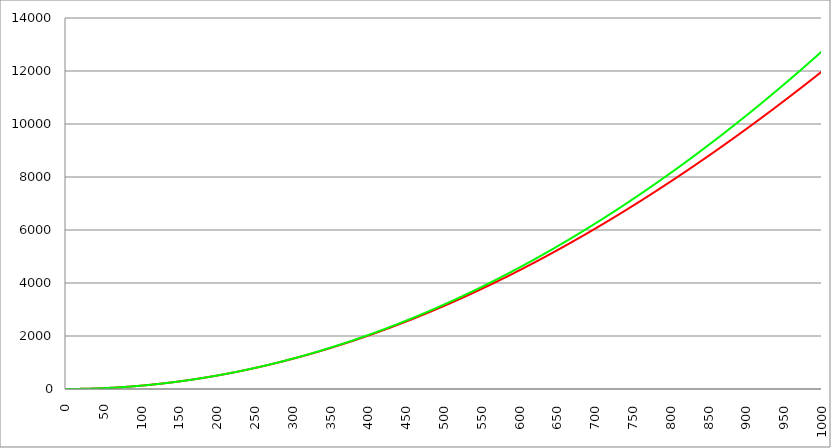
| Category | Series 1 | Series 0 | Series 2 |
|---|---|---|---|
| 0.0 | 0 | 0 |  |
| 0.5 | 0.003 | 0.003 |  |
| 1.0 | 0.013 | 0.013 |  |
| 1.5 | 0.029 | 0.029 |  |
| 2.0 | 0.051 | 0.051 |  |
| 2.5 | 0.08 | 0.08 |  |
| 3.0 | 0.115 | 0.115 |  |
| 3.5 | 0.156 | 0.156 |  |
| 4.0 | 0.204 | 0.204 |  |
| 4.5 | 0.258 | 0.258 |  |
| 5.0 | 0.319 | 0.319 |  |
| 5.5 | 0.385 | 0.385 |  |
| 6.0 | 0.459 | 0.459 |  |
| 6.5 | 0.538 | 0.538 |  |
| 7.0 | 0.624 | 0.624 |  |
| 7.5 | 0.717 | 0.717 |  |
| 8.0 | 0.816 | 0.816 |  |
| 8.5 | 0.921 | 0.921 |  |
| 9.0 | 1.032 | 1.032 |  |
| 9.5 | 1.15 | 1.15 |  |
| 10.0 | 1.274 | 1.274 |  |
| 10.5 | 1.405 | 1.405 |  |
| 11.0 | 1.542 | 1.542 |  |
| 11.5 | 1.685 | 1.685 |  |
| 12.0 | 1.835 | 1.835 |  |
| 12.5 | 1.991 | 1.991 |  |
| 13.0 | 2.154 | 2.154 |  |
| 13.5 | 2.323 | 2.323 |  |
| 14.0 | 2.498 | 2.498 |  |
| 14.5 | 2.679 | 2.679 |  |
| 15.0 | 2.867 | 2.867 |  |
| 15.5 | 3.062 | 3.062 |  |
| 16.0 | 3.262 | 3.262 |  |
| 16.5 | 3.469 | 3.469 |  |
| 17.0 | 3.683 | 3.683 |  |
| 17.5 | 3.903 | 3.903 |  |
| 18.0 | 4.129 | 4.129 |  |
| 18.5 | 4.361 | 4.362 |  |
| 19.0 | 4.6 | 4.6 |  |
| 19.5 | 4.846 | 4.846 |  |
| 20.0 | 5.097 | 5.097 |  |
| 20.5 | 5.355 | 5.356 |  |
| 21.0 | 5.62 | 5.62 |  |
| 21.5 | 5.891 | 5.891 |  |
| 22.0 | 6.168 | 6.168 |  |
| 22.5 | 6.451 | 6.451 |  |
| 23.0 | 6.741 | 6.741 |  |
| 23.5 | 7.037 | 7.038 |  |
| 24.0 | 7.34 | 7.34 |  |
| 24.5 | 7.649 | 7.649 |  |
| 25.0 | 7.964 | 7.965 |  |
| 25.5 | 8.286 | 8.287 |  |
| 26.0 | 8.614 | 8.615 |  |
| 26.5 | 8.949 | 8.949 |  |
| 27.0 | 9.29 | 9.29 |  |
| 27.5 | 9.637 | 9.637 |  |
| 28.0 | 9.991 | 9.991 |  |
| 28.5 | 10.351 | 10.351 |  |
| 29.0 | 10.717 | 10.717 |  |
| 29.5 | 11.09 | 11.09 |  |
| 30.0 | 11.469 | 11.469 |  |
| 30.5 | 11.854 | 11.855 |  |
| 31.0 | 12.246 | 12.247 |  |
| 31.5 | 12.644 | 12.645 |  |
| 32.0 | 13.049 | 13.05 |  |
| 32.5 | 13.46 | 13.461 |  |
| 33.0 | 13.877 | 13.878 |  |
| 33.5 | 14.301 | 14.302 |  |
| 34.0 | 14.731 | 14.732 |  |
| 34.5 | 15.167 | 15.168 |  |
| 35.0 | 15.61 | 15.611 |  |
| 35.5 | 16.059 | 16.06 |  |
| 36.0 | 16.514 | 16.516 |  |
| 36.5 | 16.976 | 16.978 |  |
| 37.0 | 17.445 | 17.446 |  |
| 37.5 | 17.919 | 17.921 |  |
| 38.0 | 18.4 | 18.402 |  |
| 38.5 | 18.887 | 18.889 |  |
| 39.0 | 19.381 | 19.383 |  |
| 39.5 | 19.881 | 19.883 |  |
| 40.0 | 20.388 | 20.39 |  |
| 40.5 | 20.901 | 20.903 |  |
| 41.0 | 21.42 | 21.422 |  |
| 41.5 | 21.945 | 21.948 |  |
| 42.0 | 22.477 | 22.48 |  |
| 42.5 | 23.016 | 23.018 |  |
| 43.0 | 23.56 | 23.563 |  |
| 43.5 | 24.111 | 24.114 |  |
| 44.0 | 24.669 | 24.672 |  |
| 44.5 | 25.232 | 25.236 |  |
| 45.0 | 25.802 | 25.806 |  |
| 45.5 | 26.379 | 26.383 |  |
| 46.0 | 26.962 | 26.966 |  |
| 46.5 | 27.551 | 27.555 |  |
| 47.0 | 28.147 | 28.151 |  |
| 47.5 | 28.749 | 28.753 |  |
| 48.0 | 29.357 | 29.361 |  |
| 48.5 | 29.972 | 29.976 |  |
| 49.0 | 30.593 | 30.598 |  |
| 49.5 | 31.22 | 31.225 |  |
| 50.0 | 31.854 | 31.859 |  |
| 50.5 | 32.494 | 32.5 |  |
| 51.0 | 33.141 | 33.146 |  |
| 51.5 | 33.793 | 33.799 |  |
| 52.0 | 34.453 | 34.459 |  |
| 52.5 | 35.118 | 35.125 |  |
| 53.0 | 35.79 | 35.797 |  |
| 53.5 | 36.469 | 36.476 |  |
| 54.0 | 37.153 | 37.161 |  |
| 54.5 | 37.844 | 37.852 |  |
| 55.0 | 38.542 | 38.55 |  |
| 55.5 | 39.246 | 39.254 |  |
| 56.0 | 39.956 | 39.964 |  |
| 56.5 | 40.672 | 40.681 |  |
| 57.0 | 41.395 | 41.404 |  |
| 57.5 | 42.125 | 42.134 |  |
| 58.0 | 42.86 | 42.87 |  |
| 58.5 | 43.602 | 43.612 |  |
| 59.0 | 44.351 | 44.361 |  |
| 59.5 | 45.105 | 45.116 |  |
| 60.0 | 45.866 | 45.877 |  |
| 60.5 | 46.634 | 46.645 |  |
| 61.0 | 47.408 | 47.419 |  |
| 61.5 | 48.188 | 48.2 |  |
| 62.0 | 48.974 | 48.987 |  |
| 62.5 | 49.767 | 49.78 |  |
| 63.0 | 50.566 | 50.58 |  |
| 63.5 | 51.372 | 51.386 |  |
| 64.0 | 52.184 | 52.198 |  |
| 64.5 | 53.002 | 53.017 |  |
| 65.0 | 53.827 | 53.842 |  |
| 65.5 | 54.658 | 54.674 |  |
| 66.0 | 55.495 | 55.511 |  |
| 66.5 | 56.339 | 56.356 |  |
| 67.0 | 57.189 | 57.206 |  |
| 67.5 | 58.046 | 58.063 |  |
| 68.0 | 58.909 | 58.927 |  |
| 68.5 | 59.778 | 59.797 |  |
| 69.0 | 60.654 | 60.673 |  |
| 69.5 | 61.535 | 61.555 |  |
| 70.0 | 62.424 | 62.444 |  |
| 70.5 | 63.318 | 63.339 |  |
| 71.0 | 64.219 | 64.241 |  |
| 71.5 | 65.127 | 65.149 |  |
| 72.0 | 66.041 | 66.063 |  |
| 72.5 | 66.961 | 66.984 |  |
| 73.0 | 67.887 | 67.911 |  |
| 73.5 | 68.82 | 68.845 |  |
| 74.0 | 69.759 | 69.784 |  |
| 74.5 | 70.705 | 70.731 |  |
| 75.0 | 71.657 | 71.683 |  |
| 75.5 | 72.615 | 72.642 |  |
| 76.0 | 73.579 | 73.608 |  |
| 76.5 | 74.55 | 74.579 |  |
| 77.0 | 75.528 | 75.557 |  |
| 77.5 | 76.511 | 76.542 |  |
| 78.0 | 77.501 | 77.533 |  |
| 78.5 | 78.498 | 78.53 |  |
| 79.0 | 79.5 | 79.533 |  |
| 79.5 | 80.51 | 80.543 |  |
| 80.0 | 81.525 | 81.56 |  |
| 80.5 | 82.547 | 82.582 |  |
| 81.0 | 83.575 | 83.611 |  |
| 81.5 | 84.609 | 84.647 |  |
| 82.0 | 85.65 | 85.689 |  |
| 82.5 | 86.698 | 86.737 |  |
| 83.0 | 87.751 | 87.791 |  |
| 83.5 | 88.811 | 88.852 |  |
| 84.0 | 89.877 | 89.919 |  |
| 84.5 | 90.95 | 90.993 |  |
| 85.0 | 92.029 | 92.073 |  |
| 85.5 | 93.114 | 93.16 |  |
| 86.0 | 94.206 | 94.252 |  |
| 86.5 | 95.304 | 95.351 |  |
| 87.0 | 96.409 | 96.457 |  |
| 87.5 | 97.519 | 97.569 |  |
| 88.0 | 98.636 | 98.687 |  |
| 88.5 | 99.76 | 99.812 |  |
| 89.0 | 100.89 | 100.943 |  |
| 89.5 | 102.026 | 102.08 |  |
| 90.0 | 103.168 | 103.224 |  |
| 90.5 | 104.317 | 104.374 |  |
| 91.0 | 105.473 | 105.53 |  |
| 91.5 | 106.634 | 106.693 |  |
| 92.0 | 107.802 | 107.863 |  |
| 92.5 | 108.976 | 109.038 |  |
| 93.0 | 110.157 | 110.22 |  |
| 93.5 | 111.344 | 111.408 |  |
| 94.0 | 112.537 | 112.603 |  |
| 94.5 | 113.737 | 113.804 |  |
| 95.0 | 114.943 | 115.012 |  |
| 95.5 | 116.155 | 116.226 |  |
| 96.0 | 117.374 | 117.446 |  |
| 96.5 | 118.599 | 118.672 |  |
| 97.0 | 119.831 | 119.905 |  |
| 97.5 | 121.068 | 121.145 |  |
| 98.0 | 122.313 | 122.39 |  |
| 98.5 | 123.563 | 123.642 |  |
| 99.0 | 124.82 | 124.901 |  |
| 99.5 | 126.083 | 126.166 |  |
| 100.0 | 127.352 | 127.437 |  |
| 100.5 | 128.628 | 128.714 |  |
| 101.0 | 129.911 | 129.998 |  |
| 101.5 | 131.199 | 131.289 |  |
| 102.0 | 132.494 | 132.585 |  |
| 102.5 | 133.795 | 133.888 |  |
| 103.0 | 135.103 | 135.198 |  |
| 103.5 | 136.417 | 136.514 |  |
| 104.0 | 137.737 | 137.836 |  |
| 104.5 | 139.064 | 139.164 |  |
| 105.0 | 140.397 | 140.499 |  |
| 105.5 | 141.736 | 141.84 |  |
| 106.0 | 143.082 | 143.188 |  |
| 106.5 | 144.434 | 144.542 |  |
| 107.0 | 145.792 | 145.902 |  |
| 107.5 | 147.157 | 147.269 |  |
| 108.0 | 148.528 | 148.642 |  |
| 108.5 | 149.905 | 150.022 |  |
| 109.0 | 151.289 | 151.408 |  |
| 109.5 | 152.679 | 152.8 |  |
| 110.0 | 154.075 | 154.199 |  |
| 110.5 | 155.478 | 155.604 |  |
| 111.0 | 156.887 | 157.015 |  |
| 111.5 | 158.302 | 158.433 |  |
| 112.0 | 159.724 | 159.857 |  |
| 112.5 | 161.152 | 161.287 |  |
| 113.0 | 162.587 | 162.724 |  |
| 113.5 | 164.027 | 164.167 |  |
| 114.0 | 165.474 | 165.617 |  |
| 114.5 | 166.928 | 167.073 |  |
| 115.0 | 168.388 | 168.535 |  |
| 115.5 | 169.854 | 170.004 |  |
| 116.0 | 171.326 | 171.479 |  |
| 116.5 | 172.805 | 172.96 |  |
| 117.0 | 174.29 | 174.448 |  |
| 117.5 | 175.782 | 175.943 |  |
| 118.0 | 177.28 | 177.443 |  |
| 118.5 | 178.784 | 178.95 |  |
| 119.0 | 180.294 | 180.463 |  |
| 119.5 | 181.811 | 181.983 |  |
| 120.0 | 183.334 | 183.509 |  |
| 120.5 | 184.864 | 185.042 |  |
| 121.0 | 186.4 | 186.58 |  |
| 121.5 | 187.942 | 188.125 |  |
| 122.0 | 189.49 | 189.677 |  |
| 122.5 | 191.045 | 191.235 |  |
| 123.0 | 192.606 | 192.799 |  |
| 123.5 | 194.174 | 194.37 |  |
| 124.0 | 195.748 | 195.947 |  |
| 124.5 | 197.328 | 197.53 |  |
| 125.0 | 198.914 | 199.12 |  |
| 125.5 | 200.507 | 200.716 |  |
| 126.0 | 202.106 | 202.319 |  |
| 126.5 | 203.712 | 203.928 |  |
| 127.0 | 205.324 | 205.543 |  |
| 127.5 | 206.942 | 207.165 |  |
| 128.0 | 208.566 | 208.793 |  |
| 128.5 | 210.197 | 210.427 |  |
| 129.0 | 211.834 | 212.068 |  |
| 129.5 | 213.478 | 213.715 |  |
| 130.0 | 215.127 | 215.368 |  |
| 130.5 | 216.784 | 217.028 |  |
| 131.0 | 218.446 | 218.694 |  |
| 131.5 | 220.115 | 220.367 |  |
| 132.0 | 221.79 | 222.046 |  |
| 132.5 | 223.471 | 223.731 |  |
| 133.0 | 225.159 | 225.423 |  |
| 133.5 | 226.853 | 227.121 |  |
| 134.0 | 228.554 | 228.826 |  |
| 134.5 | 230.261 | 230.536 |  |
| 135.0 | 231.974 | 232.254 |  |
| 135.5 | 233.693 | 233.977 |  |
| 136.0 | 235.419 | 235.707 |  |
| 136.5 | 237.151 | 237.444 |  |
| 137.0 | 238.889 | 239.186 |  |
| 137.5 | 240.634 | 240.935 |  |
| 138.0 | 242.385 | 242.691 |  |
| 138.5 | 244.142 | 244.453 |  |
| 139.0 | 245.906 | 246.221 |  |
| 139.5 | 247.676 | 247.995 |  |
| 140.0 | 249.452 | 249.776 |  |
| 140.5 | 251.235 | 251.564 |  |
| 141.0 | 253.024 | 253.357 |  |
| 141.5 | 254.819 | 255.157 |  |
| 142.0 | 256.621 | 256.964 |  |
| 142.5 | 258.429 | 258.776 |  |
| 143.0 | 260.243 | 260.596 |  |
| 143.5 | 262.064 | 262.421 |  |
| 144.0 | 263.891 | 264.253 |  |
| 144.5 | 265.724 | 266.091 |  |
| 145.0 | 267.563 | 267.936 |  |
| 145.5 | 269.409 | 269.787 |  |
| 146.0 | 271.261 | 271.644 |  |
| 146.5 | 273.12 | 273.508 |  |
| 147.0 | 274.985 | 275.378 |  |
| 147.5 | 276.856 | 277.255 |  |
| 148.0 | 278.733 | 279.138 |  |
| 148.5 | 280.617 | 281.027 |  |
| 149.0 | 282.507 | 282.923 |  |
| 149.5 | 284.404 | 284.825 |  |
| 150.0 | 286.306 | 286.733 |  |
| 150.5 | 288.215 | 288.648 |  |
| 151.0 | 290.131 | 290.569 |  |
| 151.5 | 292.052 | 292.496 |  |
| 152.0 | 293.98 | 294.43 |  |
| 152.5 | 295.915 | 296.37 |  |
| 153.0 | 297.855 | 298.317 |  |
| 153.5 | 299.802 | 300.27 |  |
| 154.0 | 301.755 | 302.229 |  |
| 154.5 | 303.715 | 304.195 |  |
| 155.0 | 305.681 | 306.167 |  |
| 155.5 | 307.653 | 308.146 |  |
| 156.0 | 309.631 | 310.13 |  |
| 156.5 | 311.616 | 312.122 |  |
| 157.0 | 313.607 | 314.119 |  |
| 157.5 | 315.605 | 316.123 |  |
| 158.0 | 317.608 | 318.133 |  |
| 158.5 | 319.618 | 320.15 |  |
| 159.0 | 321.635 | 322.173 |  |
| 159.5 | 323.657 | 324.203 |  |
| 160.0 | 325.686 | 326.238 |  |
| 160.5 | 327.722 | 328.281 |  |
| 161.0 | 329.763 | 330.329 |  |
| 161.5 | 331.811 | 332.384 |  |
| 162.0 | 333.865 | 334.445 |  |
| 162.5 | 335.926 | 336.513 |  |
| 163.0 | 337.992 | 338.587 |  |
| 163.5 | 340.066 | 340.667 |  |
| 164.0 | 342.145 | 342.754 |  |
| 164.5 | 344.231 | 344.847 |  |
| 165.0 | 346.323 | 346.947 |  |
| 165.5 | 348.421 | 349.053 |  |
| 166.0 | 350.526 | 351.165 |  |
| 166.5 | 352.636 | 353.284 |  |
| 167.0 | 354.754 | 355.409 |  |
| 167.5 | 356.877 | 357.54 |  |
| 168.0 | 359.007 | 359.678 |  |
| 168.5 | 361.143 | 361.822 |  |
| 169.0 | 363.286 | 363.972 |  |
| 169.5 | 365.434 | 366.129 |  |
| 170.0 | 367.589 | 368.293 |  |
| 170.5 | 369.751 | 370.462 |  |
| 171.0 | 371.918 | 372.638 |  |
| 171.5 | 374.092 | 374.82 |  |
| 172.0 | 376.272 | 377.009 |  |
| 172.5 | 378.459 | 379.204 |  |
| 173.0 | 380.652 | 381.406 |  |
| 173.5 | 382.851 | 383.614 |  |
| 174.0 | 385.056 | 385.828 |  |
| 174.5 | 387.268 | 388.048 |  |
| 175.0 | 389.486 | 390.275 |  |
| 175.5 | 391.71 | 392.509 |  |
| 176.0 | 393.941 | 394.748 |  |
| 176.5 | 396.178 | 396.994 |  |
| 177.0 | 398.421 | 399.247 |  |
| 177.5 | 400.67 | 401.506 |  |
| 178.0 | 402.926 | 403.771 |  |
| 178.5 | 405.188 | 406.042 |  |
| 179.0 | 407.456 | 408.32 |  |
| 179.5 | 409.731 | 410.605 |  |
| 180.0 | 412.012 | 412.895 |  |
| 180.5 | 414.299 | 415.192 |  |
| 181.0 | 416.593 | 417.496 |  |
| 181.5 | 418.892 | 419.806 |  |
| 182.0 | 421.198 | 422.122 |  |
| 182.5 | 423.511 | 424.444 |  |
| 183.0 | 425.829 | 426.773 |  |
| 183.5 | 428.154 | 429.109 |  |
| 184.0 | 430.486 | 431.45 |  |
| 184.5 | 432.823 | 433.798 |  |
| 185.0 | 435.167 | 436.153 |  |
| 185.5 | 437.517 | 438.513 |  |
| 186.0 | 439.873 | 440.881 |  |
| 186.5 | 442.236 | 443.254 |  |
| 187.0 | 444.605 | 445.634 |  |
| 187.5 | 446.98 | 448.02 |  |
| 188.0 | 449.362 | 450.413 |  |
| 188.5 | 451.75 | 452.812 |  |
| 189.0 | 454.144 | 455.217 |  |
| 189.5 | 456.544 | 457.629 |  |
| 190.0 | 458.951 | 460.047 |  |
| 190.5 | 461.364 | 462.472 |  |
| 191.0 | 463.783 | 464.902 |  |
| 191.5 | 466.208 | 467.34 |  |
| 192.0 | 468.64 | 469.783 |  |
| 192.5 | 471.078 | 472.233 |  |
| 193.0 | 473.522 | 474.69 |  |
| 193.5 | 475.973 | 477.152 |  |
| 194.0 | 478.43 | 479.621 |  |
| 194.5 | 480.893 | 482.097 |  |
| 195.0 | 483.362 | 484.579 |  |
| 195.5 | 485.838 | 487.067 |  |
| 196.0 | 488.32 | 489.561 |  |
| 196.5 | 490.808 | 492.062 |  |
| 197.0 | 493.303 | 494.57 |  |
| 197.5 | 495.804 | 497.083 |  |
| 198.0 | 498.311 | 499.603 |  |
| 198.5 | 500.824 | 502.13 |  |
| 199.0 | 503.344 | 504.663 |  |
| 199.5 | 505.87 | 507.202 |  |
| 200.0 | 508.402 | 509.747 |  |
| 200.5 | 510.94 | 512.299 |  |
| 201.0 | 513.485 | 514.858 |  |
| 201.5 | 516.036 | 517.422 |  |
| 202.0 | 518.593 | 519.993 |  |
| 202.5 | 521.157 | 522.571 |  |
| 203.0 | 523.727 | 525.155 |  |
| 203.5 | 526.303 | 527.745 |  |
| 204.0 | 528.885 | 530.341 |  |
| 204.5 | 531.474 | 532.944 |  |
| 205.0 | 534.069 | 535.553 |  |
| 205.5 | 536.67 | 538.169 |  |
| 206.0 | 539.277 | 540.791 |  |
| 206.5 | 541.891 | 543.419 |  |
| 207.0 | 544.511 | 546.054 |  |
| 207.5 | 547.137 | 548.695 |  |
| 208.0 | 549.769 | 551.343 |  |
| 208.5 | 552.408 | 553.997 |  |
| 209.0 | 555.053 | 556.657 |  |
| 209.5 | 557.704 | 559.324 |  |
| 210.0 | 560.362 | 561.997 |  |
| 210.5 | 563.026 | 564.676 |  |
| 211.0 | 565.696 | 567.362 |  |
| 211.5 | 568.372 | 570.054 |  |
| 212.0 | 571.054 | 572.752 |  |
| 212.5 | 573.743 | 575.457 |  |
| 213.0 | 576.438 | 578.168 |  |
| 213.5 | 579.14 | 580.886 |  |
| 214.0 | 581.847 | 583.61 |  |
| 214.5 | 584.561 | 586.34 |  |
| 215.0 | 587.281 | 589.077 |  |
| 215.5 | 590.008 | 591.82 |  |
| 216.0 | 592.74 | 594.569 |  |
| 216.5 | 595.479 | 597.325 |  |
| 217.0 | 598.224 | 600.087 |  |
| 217.5 | 600.976 | 602.856 |  |
| 218.0 | 603.733 | 605.631 |  |
| 218.5 | 606.497 | 608.412 |  |
| 219.0 | 609.267 | 611.2 |  |
| 219.5 | 612.044 | 613.994 |  |
| 220.0 | 614.826 | 616.794 |  |
| 220.5 | 617.615 | 619.601 |  |
| 221.0 | 620.41 | 622.414 |  |
| 221.5 | 623.212 | 625.234 |  |
| 222.0 | 626.019 | 628.06 |  |
| 222.5 | 628.833 | 630.892 |  |
| 223.0 | 631.653 | 633.731 |  |
| 223.5 | 634.48 | 636.576 |  |
| 224.0 | 637.312 | 639.427 |  |
| 224.5 | 640.151 | 642.285 |  |
| 225.0 | 642.996 | 645.149 |  |
| 225.5 | 645.848 | 648.02 |  |
| 226.0 | 648.705 | 650.896 |  |
| 226.5 | 651.569 | 653.78 |  |
| 227.0 | 654.439 | 656.669 |  |
| 227.5 | 657.316 | 659.565 |  |
| 228.0 | 660.198 | 662.468 |  |
| 228.5 | 663.087 | 665.376 |  |
| 229.0 | 665.982 | 668.292 |  |
| 229.5 | 668.884 | 671.213 |  |
| 230.0 | 671.791 | 674.141 |  |
| 230.5 | 674.705 | 677.075 |  |
| 231.0 | 677.625 | 680.016 |  |
| 231.5 | 680.551 | 682.963 |  |
| 232.0 | 683.484 | 685.916 |  |
| 232.5 | 686.422 | 688.876 |  |
| 233.0 | 689.367 | 691.842 |  |
| 233.5 | 692.319 | 694.814 |  |
| 234.0 | 695.276 | 697.793 |  |
| 234.5 | 698.24 | 700.778 |  |
| 235.0 | 701.21 | 703.77 |  |
| 235.5 | 704.186 | 706.768 |  |
| 236.0 | 707.168 | 709.772 |  |
| 236.5 | 710.157 | 712.783 |  |
| 237.0 | 713.152 | 715.8 |  |
| 237.5 | 716.153 | 718.824 |  |
| 238.0 | 719.16 | 721.853 |  |
| 238.5 | 722.174 | 724.89 |  |
| 239.0 | 725.194 | 727.932 |  |
| 239.5 | 728.22 | 730.981 |  |
| 240.0 | 731.252 | 734.036 |  |
| 240.5 | 734.29 | 737.098 |  |
| 241.0 | 737.335 | 740.166 |  |
| 241.5 | 740.386 | 743.24 |  |
| 242.0 | 743.443 | 746.321 |  |
| 242.5 | 746.506 | 749.408 |  |
| 243.0 | 749.576 | 752.502 |  |
| 243.5 | 752.652 | 755.602 |  |
| 244.0 | 755.734 | 758.708 |  |
| 244.5 | 758.822 | 761.821 |  |
| 245.0 | 761.917 | 764.94 |  |
| 245.5 | 765.017 | 768.065 |  |
| 246.0 | 768.124 | 771.197 |  |
| 246.5 | 771.238 | 774.335 |  |
| 247.0 | 774.357 | 777.48 |  |
| 247.5 | 777.483 | 780.63 |  |
| 248.0 | 780.614 | 783.788 |  |
| 248.5 | 783.752 | 786.951 |  |
| 249.0 | 786.897 | 790.121 |  |
| 249.5 | 790.047 | 793.298 |  |
| 250.0 | 793.204 | 796.48 |  |
| 250.5 | 796.367 | 799.669 |  |
| 251.0 | 799.536 | 802.865 |  |
| 251.5 | 802.711 | 806.067 |  |
| 252.0 | 805.893 | 809.275 |  |
| 252.5 | 809.081 | 812.49 |  |
| 253.0 | 812.275 | 815.711 |  |
| 253.5 | 815.475 | 818.938 |  |
| 254.0 | 818.681 | 822.172 |  |
| 254.5 | 821.894 | 825.412 |  |
| 255.0 | 825.113 | 828.658 |  |
| 255.5 | 828.338 | 831.911 |  |
| 256.0 | 831.569 | 835.17 |  |
| 256.5 | 834.806 | 838.436 |  |
| 257.0 | 838.05 | 841.708 |  |
| 257.5 | 841.3 | 844.986 |  |
| 258.0 | 844.556 | 848.271 |  |
| 258.5 | 847.818 | 851.562 |  |
| 259.0 | 851.087 | 854.859 |  |
| 259.5 | 854.361 | 858.163 |  |
| 260.0 | 857.642 | 861.473 |  |
| 260.5 | 860.929 | 864.79 |  |
| 261.0 | 864.223 | 868.113 |  |
| 261.5 | 867.522 | 871.442 |  |
| 262.0 | 870.828 | 874.778 |  |
| 262.5 | 874.14 | 878.12 |  |
| 263.0 | 877.458 | 881.468 |  |
| 263.5 | 880.782 | 884.823 |  |
| 264.0 | 884.113 | 888.184 |  |
| 264.5 | 887.45 | 891.551 |  |
| 265.0 | 890.793 | 894.925 |  |
| 265.5 | 894.142 | 898.306 |  |
| 266.0 | 897.497 | 901.692 |  |
| 266.5 | 900.858 | 905.085 |  |
| 267.0 | 904.226 | 908.485 |  |
| 267.5 | 907.6 | 911.89 |  |
| 268.0 | 910.98 | 915.302 |  |
| 268.5 | 914.366 | 918.721 |  |
| 269.0 | 917.759 | 922.146 |  |
| 269.5 | 921.158 | 925.577 |  |
| 270.0 | 924.562 | 929.015 |  |
| 270.5 | 927.973 | 932.459 |  |
| 271.0 | 931.391 | 935.909 |  |
| 271.5 | 934.814 | 939.366 |  |
| 272.0 | 938.244 | 942.829 |  |
| 272.5 | 941.68 | 946.298 |  |
| 273.0 | 945.122 | 949.774 |  |
| 273.5 | 948.57 | 953.256 |  |
| 274.0 | 952.024 | 956.745 |  |
| 274.5 | 955.485 | 960.24 |  |
| 275.0 | 958.951 | 963.741 |  |
| 275.5 | 962.424 | 967.249 |  |
| 276.0 | 965.903 | 970.763 |  |
| 276.5 | 969.389 | 974.283 |  |
| 277.0 | 972.88 | 977.81 |  |
| 277.5 | 976.378 | 981.343 |  |
| 278.0 | 979.882 | 984.883 |  |
| 278.5 | 983.392 | 988.429 |  |
| 279.0 | 986.908 | 991.981 |  |
| 279.5 | 990.43 | 995.54 |  |
| 280.0 | 993.959 | 999.105 |  |
| 280.5 | 997.493 | 1002.676 |  |
| 281.0 | 1001.034 | 1006.254 |  |
| 281.5 | 1004.581 | 1009.838 |  |
| 282.0 | 1008.135 | 1013.429 |  |
| 282.5 | 1011.694 | 1017.026 |  |
| 283.0 | 1015.26 | 1020.629 |  |
| 283.5 | 1018.832 | 1024.239 |  |
| 284.0 | 1022.409 | 1027.855 |  |
| 284.5 | 1025.994 | 1031.477 |  |
| 285.0 | 1029.584 | 1035.106 |  |
| 285.5 | 1033.18 | 1038.741 |  |
| 286.0 | 1036.783 | 1042.383 |  |
| 286.5 | 1040.392 | 1046.03 |  |
| 287.0 | 1044.007 | 1049.685 |  |
| 287.5 | 1047.628 | 1053.345 |  |
| 288.0 | 1051.255 | 1057.012 |  |
| 288.5 | 1054.889 | 1060.686 |  |
| 289.0 | 1058.528 | 1064.365 |  |
| 289.5 | 1062.174 | 1068.051 |  |
| 290.0 | 1065.826 | 1071.744 |  |
| 290.5 | 1069.484 | 1075.443 |  |
| 291.0 | 1073.149 | 1079.148 |  |
| 291.5 | 1076.819 | 1082.86 |  |
| 292.0 | 1080.496 | 1086.578 |  |
| 292.5 | 1084.178 | 1090.302 |  |
| 293.0 | 1087.867 | 1094.033 |  |
| 293.5 | 1091.562 | 1097.77 |  |
| 294.0 | 1095.264 | 1101.513 |  |
| 294.5 | 1098.971 | 1105.263 |  |
| 295.0 | 1102.685 | 1109.019 |  |
| 295.5 | 1106.404 | 1112.782 |  |
| 296.0 | 1110.13 | 1116.551 |  |
| 296.5 | 1113.862 | 1120.326 |  |
| 297.0 | 1117.601 | 1124.108 |  |
| 297.5 | 1121.345 | 1127.896 |  |
| 298.0 | 1125.095 | 1131.69 |  |
| 298.5 | 1128.852 | 1135.491 |  |
| 299.0 | 1132.615 | 1139.298 |  |
| 299.5 | 1136.384 | 1143.112 |  |
| 300.0 | 1140.159 | 1146.932 |  |
| 300.5 | 1143.94 | 1150.758 |  |
| 301.0 | 1147.728 | 1154.591 |  |
| 301.5 | 1151.521 | 1158.43 |  |
| 302.0 | 1155.321 | 1162.275 |  |
| 302.5 | 1159.127 | 1166.127 |  |
| 303.0 | 1162.939 | 1169.985 |  |
| 303.5 | 1166.757 | 1173.85 |  |
| 304.0 | 1170.581 | 1177.72 |  |
| 304.5 | 1174.412 | 1181.598 |  |
| 305.0 | 1178.248 | 1185.481 |  |
| 305.5 | 1182.091 | 1189.371 |  |
| 306.0 | 1185.94 | 1193.268 |  |
| 306.5 | 1189.795 | 1197.17 |  |
| 307.0 | 1193.656 | 1201.08 |  |
| 307.5 | 1197.523 | 1204.995 |  |
| 308.0 | 1201.397 | 1208.917 |  |
| 308.5 | 1205.276 | 1212.845 |  |
| 309.0 | 1209.162 | 1216.78 |  |
| 309.5 | 1213.054 | 1220.721 |  |
| 310.0 | 1216.952 | 1224.668 |  |
| 310.5 | 1220.856 | 1228.622 |  |
| 311.0 | 1224.766 | 1232.582 |  |
| 311.5 | 1228.682 | 1236.548 |  |
| 312.0 | 1232.605 | 1240.521 |  |
| 312.5 | 1236.533 | 1244.501 |  |
| 313.0 | 1240.468 | 1248.486 |  |
| 313.5 | 1244.409 | 1252.478 |  |
| 314.0 | 1248.356 | 1256.476 |  |
| 314.5 | 1252.309 | 1260.481 |  |
| 315.0 | 1256.269 | 1264.492 |  |
| 315.5 | 1260.234 | 1268.51 |  |
| 316.0 | 1264.205 | 1272.533 |  |
| 316.5 | 1268.183 | 1276.564 |  |
| 317.0 | 1272.167 | 1280.6 |  |
| 317.5 | 1276.157 | 1284.643 |  |
| 318.0 | 1280.153 | 1288.692 |  |
| 318.5 | 1284.155 | 1292.748 |  |
| 319.0 | 1288.163 | 1296.81 |  |
| 319.5 | 1292.178 | 1300.879 |  |
| 320.0 | 1296.198 | 1304.953 |  |
| 320.5 | 1300.225 | 1309.035 |  |
| 321.0 | 1304.258 | 1313.122 |  |
| 321.5 | 1308.297 | 1317.216 |  |
| 322.0 | 1312.342 | 1321.316 |  |
| 322.5 | 1316.393 | 1325.423 |  |
| 323.0 | 1320.45 | 1329.536 |  |
| 323.5 | 1324.513 | 1333.655 |  |
| 324.0 | 1328.583 | 1337.781 |  |
| 324.5 | 1332.658 | 1341.913 |  |
| 325.0 | 1336.74 | 1346.052 |  |
| 325.5 | 1340.828 | 1350.197 |  |
| 326.0 | 1344.922 | 1354.348 |  |
| 326.5 | 1349.022 | 1358.506 |  |
| 327.0 | 1353.128 | 1362.67 |  |
| 327.5 | 1357.24 | 1366.84 |  |
| 328.0 | 1361.358 | 1371.017 |  |
| 328.5 | 1365.483 | 1375.2 |  |
| 329.0 | 1369.613 | 1379.389 |  |
| 329.5 | 1373.75 | 1383.585 |  |
| 330.0 | 1377.893 | 1387.787 |  |
| 330.5 | 1382.042 | 1391.996 |  |
| 331.0 | 1386.197 | 1396.211 |  |
| 331.5 | 1390.358 | 1400.432 |  |
| 332.0 | 1394.525 | 1404.66 |  |
| 332.5 | 1398.698 | 1408.894 |  |
| 333.0 | 1402.878 | 1413.135 |  |
| 333.5 | 1407.063 | 1417.381 |  |
| 334.0 | 1411.255 | 1421.635 |  |
| 334.5 | 1415.452 | 1425.894 |  |
| 335.0 | 1419.656 | 1430.16 |  |
| 335.5 | 1423.866 | 1434.432 |  |
| 336.0 | 1428.082 | 1438.711 |  |
| 336.5 | 1432.304 | 1442.996 |  |
| 337.0 | 1436.532 | 1447.288 |  |
| 337.5 | 1440.766 | 1451.585 |  |
| 338.0 | 1445.007 | 1455.89 |  |
| 338.5 | 1449.253 | 1460.2 |  |
| 339.0 | 1453.506 | 1464.517 |  |
| 339.5 | 1457.764 | 1468.84 |  |
| 340.0 | 1462.029 | 1473.17 |  |
| 340.5 | 1466.3 | 1477.506 |  |
| 341.0 | 1470.577 | 1481.849 |  |
| 341.5 | 1474.86 | 1486.197 |  |
| 342.0 | 1479.149 | 1490.552 |  |
| 342.5 | 1483.444 | 1494.914 |  |
| 343.0 | 1487.745 | 1499.282 |  |
| 343.5 | 1492.052 | 1503.656 |  |
| 344.0 | 1496.366 | 1508.037 |  |
| 344.5 | 1500.685 | 1512.424 |  |
| 345.0 | 1505.011 | 1516.817 |  |
| 345.5 | 1509.342 | 1521.217 |  |
| 346.0 | 1513.68 | 1525.623 |  |
| 346.5 | 1518.024 | 1530.036 |  |
| 347.0 | 1522.374 | 1534.454 |  |
| 347.5 | 1526.73 | 1538.88 |  |
| 348.0 | 1531.092 | 1543.311 |  |
| 348.5 | 1535.46 | 1547.749 |  |
| 349.0 | 1539.834 | 1552.194 |  |
| 349.5 | 1544.214 | 1556.644 |  |
| 350.0 | 1548.601 | 1561.101 |  |
| 350.5 | 1552.993 | 1565.565 |  |
| 351.0 | 1557.391 | 1570.035 |  |
| 351.5 | 1561.796 | 1574.511 |  |
| 352.0 | 1566.207 | 1578.994 |  |
| 352.5 | 1570.623 | 1583.483 |  |
| 353.0 | 1575.046 | 1587.978 |  |
| 353.5 | 1579.475 | 1592.48 |  |
| 354.0 | 1583.91 | 1596.988 |  |
| 354.5 | 1588.351 | 1601.502 |  |
| 355.0 | 1592.798 | 1606.023 |  |
| 355.5 | 1597.251 | 1610.55 |  |
| 356.0 | 1601.71 | 1615.084 |  |
| 356.5 | 1606.175 | 1619.624 |  |
| 357.0 | 1610.646 | 1624.17 |  |
| 357.5 | 1615.123 | 1628.723 |  |
| 358.0 | 1619.607 | 1633.282 |  |
| 358.5 | 1624.096 | 1637.847 |  |
| 359.0 | 1628.592 | 1642.419 |  |
| 359.5 | 1633.093 | 1646.997 |  |
| 360.0 | 1637.601 | 1651.582 |  |
| 360.5 | 1642.115 | 1656.173 |  |
| 361.0 | 1646.634 | 1660.77 |  |
| 361.5 | 1651.16 | 1665.374 |  |
| 362.0 | 1655.692 | 1669.984 |  |
| 362.5 | 1660.23 | 1674.6 |  |
| 363.0 | 1664.774 | 1679.223 |  |
| 363.5 | 1669.324 | 1683.852 |  |
| 364.0 | 1673.88 | 1688.487 |  |
| 364.5 | 1678.442 | 1693.129 |  |
| 365.0 | 1683.01 | 1697.778 |  |
| 365.5 | 1687.584 | 1702.432 |  |
| 366.0 | 1692.164 | 1707.093 |  |
| 366.5 | 1696.75 | 1711.761 |  |
| 367.0 | 1701.343 | 1716.434 |  |
| 367.5 | 1705.941 | 1721.114 |  |
| 368.0 | 1710.545 | 1725.801 |  |
| 368.5 | 1715.156 | 1730.494 |  |
| 369.0 | 1719.772 | 1735.193 |  |
| 369.5 | 1724.395 | 1739.899 |  |
| 370.0 | 1729.023 | 1744.611 |  |
| 370.5 | 1733.658 | 1749.329 |  |
| 371.0 | 1738.299 | 1754.054 |  |
| 371.5 | 1742.945 | 1758.785 |  |
| 372.0 | 1747.598 | 1763.522 |  |
| 372.5 | 1752.257 | 1768.266 |  |
| 373.0 | 1756.921 | 1773.016 |  |
| 373.5 | 1761.592 | 1777.773 |  |
| 374.0 | 1766.269 | 1782.536 |  |
| 374.5 | 1770.952 | 1787.305 |  |
| 375.0 | 1775.641 | 1792.081 |  |
| 375.5 | 1780.336 | 1796.863 |  |
| 376.0 | 1785.037 | 1801.651 |  |
| 376.5 | 1789.744 | 1806.446 |  |
| 377.0 | 1794.457 | 1811.247 |  |
| 377.5 | 1799.176 | 1816.055 |  |
| 378.0 | 1803.901 | 1820.869 |  |
| 378.5 | 1808.632 | 1825.689 |  |
| 379.0 | 1813.369 | 1830.516 |  |
| 379.5 | 1818.112 | 1835.349 |  |
| 380.0 | 1822.861 | 1840.188 |  |
| 380.5 | 1827.616 | 1845.034 |  |
| 381.0 | 1832.377 | 1849.886 |  |
| 381.5 | 1837.145 | 1854.745 |  |
| 382.0 | 1841.918 | 1859.61 |  |
| 382.5 | 1846.697 | 1864.481 |  |
| 383.0 | 1851.482 | 1869.358 |  |
| 383.5 | 1856.274 | 1874.243 |  |
| 384.0 | 1861.071 | 1879.133 |  |
| 384.5 | 1865.874 | 1884.03 |  |
| 385.0 | 1870.683 | 1888.933 |  |
| 385.5 | 1875.499 | 1893.842 |  |
| 386.0 | 1880.32 | 1898.758 |  |
| 386.5 | 1885.147 | 1903.68 |  |
| 387.0 | 1889.981 | 1908.609 |  |
| 387.5 | 1894.82 | 1913.544 |  |
| 388.0 | 1899.666 | 1918.485 |  |
| 388.5 | 1904.517 | 1923.433 |  |
| 389.0 | 1909.374 | 1928.387 |  |
| 389.5 | 1914.238 | 1933.348 |  |
| 390.0 | 1919.107 | 1938.315 |  |
| 390.5 | 1923.982 | 1943.288 |  |
| 391.0 | 1928.864 | 1948.267 |  |
| 391.5 | 1933.751 | 1953.253 |  |
| 392.0 | 1938.645 | 1958.246 |  |
| 392.5 | 1943.544 | 1963.244 |  |
| 393.0 | 1948.449 | 1968.249 |  |
| 393.5 | 1953.361 | 1973.261 |  |
| 394.0 | 1958.278 | 1978.279 |  |
| 394.5 | 1963.202 | 1983.303 |  |
| 395.0 | 1968.131 | 1988.334 |  |
| 395.5 | 1973.066 | 1993.37 |  |
| 396.0 | 1978.008 | 1998.414 |  |
| 396.5 | 1982.955 | 2003.463 |  |
| 397.0 | 1987.908 | 2008.52 |  |
| 397.5 | 1992.868 | 2013.582 |  |
| 398.0 | 1997.833 | 2018.651 |  |
| 398.5 | 2002.804 | 2023.726 |  |
| 399.0 | 2007.782 | 2028.807 |  |
| 399.5 | 2012.765 | 2033.895 |  |
| 400.0 | 2017.754 | 2038.99 |  |
| 400.5 | 2022.749 | 2044.09 |  |
| 401.0 | 2027.751 | 2049.197 |  |
| 401.5 | 2032.758 | 2054.311 |  |
| 402.0 | 2037.771 | 2059.431 |  |
| 402.5 | 2042.79 | 2064.557 |  |
| 403.0 | 2047.815 | 2069.689 |  |
| 403.5 | 2052.846 | 2074.828 |  |
| 404.0 | 2057.884 | 2079.973 |  |
| 404.5 | 2062.927 | 2085.125 |  |
| 405.0 | 2067.976 | 2090.283 |  |
| 405.5 | 2073.031 | 2095.447 |  |
| 406.0 | 2078.092 | 2100.618 |  |
| 406.5 | 2083.159 | 2105.795 |  |
| 407.0 | 2088.232 | 2110.979 |  |
| 407.5 | 2093.311 | 2116.169 |  |
| 408.0 | 2098.396 | 2121.365 |  |
| 408.5 | 2103.486 | 2126.567 |  |
| 409.0 | 2108.583 | 2131.776 |  |
| 409.5 | 2113.686 | 2136.992 |  |
| 410.0 | 2118.795 | 2142.214 |  |
| 410.5 | 2123.91 | 2147.442 |  |
| 411.0 | 2129.03 | 2152.676 |  |
| 411.5 | 2134.157 | 2157.917 |  |
| 412.0 | 2139.29 | 2163.164 |  |
| 412.5 | 2144.428 | 2168.418 |  |
| 413.0 | 2149.573 | 2173.678 |  |
| 413.5 | 2154.723 | 2178.944 |  |
| 414.0 | 2159.88 | 2184.217 |  |
| 414.5 | 2165.042 | 2189.496 |  |
| 415.0 | 2170.211 | 2194.781 |  |
| 415.5 | 2175.385 | 2200.073 |  |
| 416.0 | 2180.565 | 2205.371 |  |
| 416.5 | 2185.751 | 2210.676 |  |
| 417.0 | 2190.944 | 2215.987 |  |
| 417.5 | 2196.142 | 2221.304 |  |
| 418.0 | 2201.346 | 2226.628 |  |
| 418.5 | 2206.556 | 2231.958 |  |
| 419.0 | 2211.772 | 2237.294 |  |
| 419.5 | 2216.994 | 2242.637 |  |
| 420.0 | 2222.222 | 2247.986 |  |
| 420.5 | 2227.456 | 2253.342 |  |
| 421.0 | 2232.695 | 2258.704 |  |
| 421.5 | 2237.941 | 2264.072 |  |
| 422.0 | 2243.193 | 2269.446 |  |
| 422.5 | 2248.451 | 2274.828 |  |
| 423.0 | 2253.714 | 2280.215 |  |
| 423.5 | 2258.984 | 2285.609 |  |
| 424.0 | 2264.259 | 2291.009 |  |
| 424.5 | 2269.54 | 2296.415 |  |
| 425.0 | 2274.828 | 2301.828 |  |
| 425.5 | 2280.121 | 2307.247 |  |
| 426.0 | 2285.42 | 2312.673 |  |
| 426.5 | 2290.725 | 2318.105 |  |
| 427.0 | 2296.036 | 2323.543 |  |
| 427.5 | 2301.353 | 2328.988 |  |
| 428.0 | 2306.676 | 2334.439 |  |
| 428.5 | 2312.005 | 2339.897 |  |
| 429.0 | 2317.34 | 2345.361 |  |
| 429.5 | 2322.681 | 2350.831 |  |
| 430.0 | 2328.027 | 2356.307 |  |
| 430.5 | 2333.38 | 2361.79 |  |
| 431.0 | 2338.739 | 2367.28 |  |
| 431.5 | 2344.103 | 2372.775 |  |
| 432.0 | 2349.473 | 2378.278 |  |
| 432.5 | 2354.85 | 2383.786 |  |
| 433.0 | 2360.232 | 2389.301 |  |
| 433.5 | 2365.62 | 2394.822 |  |
| 434.0 | 2371.014 | 2400.35 |  |
| 434.5 | 2376.414 | 2405.884 |  |
| 435.0 | 2381.82 | 2411.424 |  |
| 435.5 | 2387.232 | 2416.971 |  |
| 436.0 | 2392.649 | 2422.524 |  |
| 436.5 | 2398.073 | 2428.083 |  |
| 437.0 | 2403.503 | 2433.649 |  |
| 437.5 | 2408.938 | 2439.221 |  |
| 438.0 | 2414.379 | 2444.8 |  |
| 438.5 | 2419.827 | 2450.385 |  |
| 439.0 | 2425.28 | 2455.976 |  |
| 439.5 | 2430.739 | 2461.573 |  |
| 440.0 | 2436.204 | 2467.178 |  |
| 440.5 | 2441.675 | 2472.788 |  |
| 441.0 | 2447.152 | 2478.405 |  |
| 441.5 | 2452.634 | 2484.028 |  |
| 442.0 | 2458.123 | 2489.657 |  |
| 442.5 | 2463.618 | 2495.293 |  |
| 443.0 | 2469.118 | 2500.936 |  |
| 443.5 | 2474.624 | 2506.584 |  |
| 444.0 | 2480.137 | 2512.239 |  |
| 444.5 | 2485.655 | 2517.901 |  |
| 445.0 | 2491.179 | 2523.568 |  |
| 445.5 | 2496.709 | 2529.242 |  |
| 446.0 | 2502.245 | 2534.923 |  |
| 446.5 | 2507.786 | 2540.61 |  |
| 447.0 | 2513.334 | 2546.303 |  |
| 447.5 | 2518.887 | 2552.003 |  |
| 448.0 | 2524.447 | 2557.709 |  |
| 448.5 | 2530.012 | 2563.421 |  |
| 449.0 | 2535.583 | 2569.14 |  |
| 449.5 | 2541.16 | 2574.865 |  |
| 450.0 | 2546.743 | 2580.596 |  |
| 450.5 | 2552.332 | 2586.334 |  |
| 451.0 | 2557.927 | 2592.078 |  |
| 451.5 | 2563.528 | 2597.829 |  |
| 452.0 | 2569.134 | 2603.586 |  |
| 452.5 | 2574.746 | 2609.349 |  |
| 453.0 | 2580.365 | 2615.119 |  |
| 453.5 | 2585.989 | 2620.895 |  |
| 454.0 | 2591.619 | 2626.677 |  |
| 454.5 | 2597.255 | 2632.466 |  |
| 455.0 | 2602.897 | 2638.262 |  |
| 455.5 | 2608.544 | 2644.063 |  |
| 456.0 | 2614.198 | 2649.871 |  |
| 456.5 | 2619.857 | 2655.685 |  |
| 457.0 | 2625.523 | 2661.506 |  |
| 457.5 | 2631.194 | 2667.333 |  |
| 458.0 | 2636.871 | 2673.166 |  |
| 458.5 | 2642.554 | 2679.006 |  |
| 459.0 | 2648.242 | 2684.852 |  |
| 459.5 | 2653.937 | 2690.705 |  |
| 460.0 | 2659.638 | 2696.564 |  |
| 460.5 | 2665.344 | 2702.429 |  |
| 461.0 | 2671.056 | 2708.301 |  |
| 461.5 | 2676.774 | 2714.179 |  |
| 462.0 | 2682.498 | 2720.063 |  |
| 462.5 | 2688.228 | 2725.954 |  |
| 463.0 | 2693.964 | 2731.851 |  |
| 463.5 | 2699.705 | 2737.755 |  |
| 464.0 | 2705.453 | 2743.665 |  |
| 464.5 | 2711.206 | 2749.581 |  |
| 465.0 | 2716.965 | 2755.503 |  |
| 465.5 | 2722.73 | 2761.432 |  |
| 466.0 | 2728.501 | 2767.368 |  |
| 466.5 | 2734.278 | 2773.31 |  |
| 467.0 | 2740.06 | 2779.258 |  |
| 467.5 | 2745.849 | 2785.212 |  |
| 468.0 | 2751.643 | 2791.173 |  |
| 468.5 | 2757.443 | 2797.14 |  |
| 469.0 | 2763.249 | 2803.114 |  |
| 469.5 | 2769.061 | 2809.094 |  |
| 470.0 | 2774.879 | 2815.08 |  |
| 470.5 | 2780.702 | 2821.073 |  |
| 471.0 | 2786.531 | 2827.072 |  |
| 471.5 | 2792.367 | 2833.077 |  |
| 472.0 | 2798.208 | 2839.089 |  |
| 472.5 | 2804.055 | 2845.107 |  |
| 473.0 | 2809.907 | 2851.132 |  |
| 473.5 | 2815.766 | 2857.163 |  |
| 474.0 | 2821.63 | 2863.2 |  |
| 474.5 | 2827.5 | 2869.244 |  |
| 475.0 | 2833.376 | 2875.294 |  |
| 475.5 | 2839.258 | 2881.35 |  |
| 476.0 | 2845.146 | 2887.413 |  |
| 476.5 | 2851.04 | 2893.482 |  |
| 477.0 | 2856.939 | 2899.558 |  |
| 477.5 | 2862.844 | 2905.64 |  |
| 478.0 | 2868.755 | 2911.728 |  |
| 478.5 | 2874.672 | 2917.823 |  |
| 479.0 | 2880.595 | 2923.924 |  |
| 479.5 | 2886.524 | 2930.031 |  |
| 480.0 | 2892.458 | 2936.145 |  |
| 480.5 | 2898.398 | 2942.265 |  |
| 481.0 | 2904.344 | 2948.392 |  |
| 481.5 | 2910.296 | 2954.525 |  |
| 482.0 | 2916.254 | 2960.664 |  |
| 482.5 | 2922.217 | 2966.81 |  |
| 483.0 | 2928.186 | 2972.962 |  |
| 483.5 | 2934.161 | 2979.12 |  |
| 484.0 | 2940.142 | 2985.285 |  |
| 484.5 | 2946.129 | 2991.456 |  |
| 485.0 | 2952.122 | 2997.633 |  |
| 485.5 | 2958.12 | 3003.817 |  |
| 486.0 | 2964.124 | 3010.008 |  |
| 486.5 | 2970.134 | 3016.204 |  |
| 487.0 | 2976.15 | 3022.407 |  |
| 487.5 | 2982.172 | 3028.617 |  |
| 488.0 | 2988.199 | 3034.832 |  |
| 488.5 | 2994.232 | 3041.054 |  |
| 489.0 | 3000.272 | 3047.283 |  |
| 489.5 | 3006.316 | 3053.518 |  |
| 490.0 | 3012.367 | 3059.759 |  |
| 490.5 | 3018.423 | 3066.006 |  |
| 491.0 | 3024.486 | 3072.26 |  |
| 491.5 | 3030.554 | 3078.521 |  |
| 492.0 | 3036.628 | 3084.788 |  |
| 492.5 | 3042.707 | 3091.061 |  |
| 493.0 | 3048.793 | 3097.34 |  |
| 493.5 | 3054.884 | 3103.626 |  |
| 494.0 | 3060.981 | 3109.918 |  |
| 494.5 | 3067.084 | 3116.217 |  |
| 495.0 | 3073.193 | 3122.522 |  |
| 495.5 | 3079.307 | 3128.833 |  |
| 496.0 | 3085.427 | 3135.151 |  |
| 496.5 | 3091.553 | 3141.475 |  |
| 497.0 | 3097.685 | 3147.805 |  |
| 497.5 | 3103.823 | 3154.142 |  |
| 498.0 | 3109.966 | 3160.485 |  |
| 498.5 | 3116.115 | 3166.835 |  |
| 499.0 | 3122.27 | 3173.19 |  |
| 499.5 | 3128.431 | 3179.553 |  |
| 500.0 | 3134.597 | 3185.921 |  |
| 500.5 | 3140.77 | 3192.296 |  |
| 501.0 | 3146.948 | 3198.678 |  |
| 501.5 | 3153.132 | 3205.066 |  |
| 502.0 | 3159.321 | 3211.46 |  |
| 502.5 | 3165.517 | 3217.86 |  |
| 503.0 | 3171.718 | 3224.267 |  |
| 503.5 | 3177.925 | 3230.68 |  |
| 504.0 | 3184.138 | 3237.1 |  |
| 504.5 | 3190.356 | 3243.526 |  |
| 505.0 | 3196.58 | 3249.958 |  |
| 505.5 | 3202.81 | 3256.397 |  |
| 506.0 | 3209.046 | 3262.842 |  |
| 506.5 | 3215.288 | 3269.294 |  |
| 507.0 | 3221.535 | 3275.752 |  |
| 507.5 | 3227.788 | 3282.216 |  |
| 508.0 | 3234.047 | 3288.686 |  |
| 508.5 | 3240.312 | 3295.163 |  |
| 509.0 | 3246.582 | 3301.647 |  |
| 509.5 | 3252.858 | 3308.137 |  |
| 510.0 | 3259.14 | 3314.633 |  |
| 510.5 | 3265.428 | 3321.135 |  |
| 511.0 | 3271.721 | 3327.644 |  |
| 511.5 | 3278.021 | 3334.159 |  |
| 512.0 | 3284.326 | 3340.681 |  |
| 512.5 | 3290.636 | 3347.209 |  |
| 513.0 | 3296.953 | 3353.743 |  |
| 513.5 | 3303.275 | 3360.284 |  |
| 514.0 | 3309.603 | 3366.831 |  |
| 514.5 | 3315.937 | 3373.384 |  |
| 515.0 | 3322.276 | 3379.944 |  |
| 515.5 | 3328.621 | 3386.51 |  |
| 516.0 | 3334.972 | 3393.083 |  |
| 516.5 | 3341.329 | 3399.662 |  |
| 517.0 | 3347.691 | 3406.247 |  |
| 517.5 | 3354.06 | 3412.839 |  |
| 518.0 | 3360.434 | 3419.437 |  |
| 518.5 | 3366.813 | 3426.041 |  |
| 519.0 | 3373.199 | 3432.652 |  |
| 519.5 | 3379.59 | 3439.269 |  |
| 520.0 | 3385.987 | 3445.893 |  |
| 520.5 | 3392.389 | 3452.522 |  |
| 521.0 | 3398.798 | 3459.159 |  |
| 521.5 | 3405.212 | 3465.801 |  |
| 522.0 | 3411.632 | 3472.45 |  |
| 522.5 | 3418.057 | 3479.106 |  |
| 523.0 | 3424.489 | 3485.768 |  |
| 523.5 | 3430.926 | 3492.436 |  |
| 524.0 | 3437.368 | 3499.11 |  |
| 524.5 | 3443.817 | 3505.791 |  |
| 525.0 | 3450.271 | 3512.478 |  |
| 525.5 | 3456.731 | 3519.172 |  |
| 526.0 | 3463.197 | 3525.872 |  |
| 526.5 | 3469.668 | 3532.578 |  |
| 527.0 | 3476.145 | 3539.291 |  |
| 527.5 | 3482.628 | 3546.01 |  |
| 528.0 | 3489.117 | 3552.736 |  |
| 528.5 | 3495.611 | 3559.467 |  |
| 529.0 | 3502.111 | 3566.206 |  |
| 529.5 | 3508.617 | 3572.95 |  |
| 530.0 | 3515.128 | 3579.701 |  |
| 530.5 | 3521.645 | 3586.459 |  |
| 531.0 | 3528.168 | 3593.222 |  |
| 531.5 | 3534.696 | 3599.992 |  |
| 532.0 | 3541.231 | 3606.769 |  |
| 532.5 | 3547.771 | 3613.552 |  |
| 533.0 | 3554.316 | 3620.341 |  |
| 533.5 | 3560.868 | 3627.136 |  |
| 534.0 | 3567.425 | 3633.938 |  |
| 534.5 | 3573.988 | 3640.747 |  |
| 535.0 | 3580.556 | 3647.561 |  |
| 535.5 | 3587.13 | 3654.382 |  |
| 536.0 | 3593.71 | 3661.21 |  |
| 536.5 | 3600.296 | 3668.044 |  |
| 537.0 | 3606.887 | 3674.884 |  |
| 537.5 | 3613.484 | 3681.73 |  |
| 538.0 | 3620.087 | 3688.583 |  |
| 538.5 | 3626.695 | 3695.443 |  |
| 539.0 | 3633.309 | 3702.308 |  |
| 539.5 | 3639.929 | 3709.18 |  |
| 540.0 | 3646.555 | 3716.059 |  |
| 540.5 | 3653.186 | 3722.943 |  |
| 541.0 | 3659.823 | 3729.835 |  |
| 541.5 | 3666.465 | 3736.732 |  |
| 542.0 | 3673.113 | 3743.636 |  |
| 542.5 | 3679.767 | 3750.546 |  |
| 543.0 | 3686.427 | 3757.463 |  |
| 543.5 | 3693.092 | 3764.386 |  |
| 544.0 | 3699.763 | 3771.315 |  |
| 544.5 | 3706.44 | 3778.251 |  |
| 545.0 | 3713.122 | 3785.193 |  |
| 545.5 | 3719.81 | 3792.142 |  |
| 546.0 | 3726.504 | 3799.097 |  |
| 546.5 | 3733.203 | 3806.058 |  |
| 547.0 | 3739.908 | 3813.025 |  |
| 547.5 | 3746.619 | 3819.999 |  |
| 548.0 | 3753.335 | 3826.98 |  |
| 548.5 | 3760.057 | 3833.966 |  |
| 549.0 | 3766.785 | 3840.96 |  |
| 549.5 | 3773.519 | 3847.959 |  |
| 550.0 | 3780.258 | 3854.965 |  |
| 550.5 | 3787.002 | 3861.977 |  |
| 551.0 | 3793.753 | 3868.996 |  |
| 551.5 | 3800.509 | 3876.021 |  |
| 552.0 | 3807.271 | 3883.052 |  |
| 552.5 | 3814.038 | 3890.09 |  |
| 553.0 | 3820.811 | 3897.134 |  |
| 553.5 | 3827.59 | 3904.184 |  |
| 554.0 | 3834.374 | 3911.241 |  |
| 554.5 | 3841.164 | 3918.304 |  |
| 555.0 | 3847.96 | 3925.374 |  |
| 555.5 | 3854.761 | 3932.45 |  |
| 556.0 | 3861.568 | 3939.532 |  |
| 556.5 | 3868.381 | 3946.621 |  |
| 557.0 | 3875.199 | 3953.716 |  |
| 557.5 | 3882.023 | 3960.817 |  |
| 558.0 | 3888.853 | 3967.925 |  |
| 558.5 | 3895.688 | 3975.039 |  |
| 559.0 | 3902.529 | 3982.16 |  |
| 559.5 | 3909.375 | 3989.287 |  |
| 560.0 | 3916.228 | 3996.42 |  |
| 560.5 | 3923.085 | 4003.559 |  |
| 561.0 | 3929.949 | 4010.705 |  |
| 561.5 | 3936.818 | 4017.858 |  |
| 562.0 | 3943.693 | 4025.017 |  |
| 562.5 | 3950.573 | 4032.182 |  |
| 563.0 | 3957.459 | 4039.353 |  |
| 563.5 | 3964.351 | 4046.531 |  |
| 564.0 | 3971.248 | 4053.715 |  |
| 564.5 | 3978.151 | 4060.906 |  |
| 565.0 | 3985.06 | 4068.103 |  |
| 565.5 | 3991.974 | 4075.306 |  |
| 566.0 | 3998.894 | 4082.516 |  |
| 566.5 | 4005.819 | 4089.732 |  |
| 567.0 | 4012.75 | 4096.955 |  |
| 567.5 | 4019.687 | 4104.184 |  |
| 568.0 | 4026.629 | 4111.419 |  |
| 568.5 | 4033.577 | 4118.66 |  |
| 569.0 | 4040.531 | 4125.908 |  |
| 569.5 | 4047.49 | 4133.163 |  |
| 570.0 | 4054.455 | 4140.423 |  |
| 570.5 | 4061.425 | 4147.691 |  |
| 571.0 | 4068.402 | 4154.964 |  |
| 571.5 | 4075.383 | 4162.244 |  |
| 572.0 | 4082.371 | 4169.53 |  |
| 572.5 | 4089.363 | 4176.823 |  |
| 573.0 | 4096.362 | 4184.122 |  |
| 573.5 | 4103.366 | 4191.427 |  |
| 574.0 | 4110.376 | 4198.739 |  |
| 574.5 | 4117.391 | 4206.057 |  |
| 575.0 | 4124.412 | 4213.381 |  |
| 575.5 | 4131.439 | 4220.712 |  |
| 576.0 | 4138.471 | 4228.049 |  |
| 576.5 | 4145.509 | 4235.393 |  |
| 577.0 | 4152.552 | 4242.742 |  |
| 577.5 | 4159.601 | 4250.099 |  |
| 578.0 | 4166.656 | 4257.461 |  |
| 578.5 | 4173.716 | 4264.83 |  |
| 579.0 | 4180.782 | 4272.206 |  |
| 579.5 | 4187.853 | 4279.588 |  |
| 580.0 | 4194.93 | 4286.976 |  |
| 580.5 | 4202.013 | 4294.37 |  |
| 581.0 | 4209.101 | 4301.771 |  |
| 581.5 | 4216.195 | 4309.179 |  |
| 582.0 | 4223.294 | 4316.592 |  |
| 582.5 | 4230.399 | 4324.012 |  |
| 583.0 | 4237.51 | 4331.439 |  |
| 583.5 | 4244.626 | 4338.871 |  |
| 584.0 | 4251.748 | 4346.31 |  |
| 584.5 | 4258.875 | 4353.756 |  |
| 585.0 | 4266.008 | 4361.208 |  |
| 585.5 | 4273.146 | 4368.666 |  |
| 586.0 | 4280.29 | 4376.131 |  |
| 586.5 | 4287.44 | 4383.602 |  |
| 587.0 | 4294.595 | 4391.079 |  |
| 587.5 | 4301.756 | 4398.563 |  |
| 588.0 | 4308.923 | 4406.053 |  |
| 588.5 | 4316.095 | 4413.549 |  |
| 589.0 | 4323.272 | 4421.052 |  |
| 589.5 | 4330.455 | 4428.561 |  |
| 590.0 | 4337.644 | 4436.077 |  |
| 590.5 | 4344.838 | 4443.599 |  |
| 591.0 | 4352.038 | 4451.127 |  |
| 591.5 | 4359.243 | 4458.662 |  |
| 592.0 | 4366.454 | 4466.203 |  |
| 592.5 | 4373.671 | 4473.75 |  |
| 593.0 | 4380.893 | 4481.304 |  |
| 593.5 | 4388.121 | 4488.864 |  |
| 594.0 | 4395.354 | 4496.431 |  |
| 594.5 | 4402.593 | 4504.004 |  |
| 595.0 | 4409.837 | 4511.583 |  |
| 595.5 | 4417.087 | 4519.169 |  |
| 596.0 | 4424.342 | 4526.761 |  |
| 596.5 | 4431.603 | 4534.359 |  |
| 597.0 | 4438.87 | 4541.964 |  |
| 597.5 | 4446.142 | 4549.575 |  |
| 598.0 | 4453.42 | 4557.193 |  |
| 598.5 | 4460.703 | 4564.817 |  |
| 599.0 | 4467.992 | 4572.447 |  |
| 599.5 | 4475.286 | 4580.084 |  |
| 600.0 | 4482.586 | 4587.727 |  |
| 600.5 | 4489.891 | 4595.376 |  |
| 601.0 | 4497.202 | 4603.032 |  |
| 601.5 | 4504.519 | 4610.694 |  |
| 602.0 | 4511.841 | 4618.363 |  |
| 602.5 | 4519.168 | 4626.038 |  |
| 603.0 | 4526.502 | 4633.719 |  |
| 603.5 | 4533.84 | 4641.406 |  |
| 604.0 | 4541.184 | 4649.1 |  |
| 604.5 | 4548.534 | 4656.801 |  |
| 605.0 | 4555.889 | 4664.508 |  |
| 605.5 | 4563.25 | 4672.221 |  |
| 606.0 | 4570.617 | 4679.94 |  |
| 606.5 | 4577.988 | 4687.666 |  |
| 607.0 | 4585.366 | 4695.398 |  |
| 607.5 | 4592.749 | 4703.137 |  |
| 608.0 | 4600.137 | 4710.882 |  |
| 608.5 | 4607.531 | 4718.633 |  |
| 609.0 | 4614.931 | 4726.391 |  |
| 609.5 | 4622.336 | 4734.155 |  |
| 610.0 | 4629.746 | 4741.925 |  |
| 610.5 | 4637.162 | 4749.702 |  |
| 611.0 | 4644.584 | 4757.485 |  |
| 611.5 | 4652.011 | 4765.275 |  |
| 612.0 | 4659.444 | 4773.071 |  |
| 612.5 | 4666.882 | 4780.873 |  |
| 613.0 | 4674.326 | 4788.682 |  |
| 613.5 | 4681.775 | 4796.497 |  |
| 614.0 | 4689.23 | 4804.318 |  |
| 614.5 | 4696.69 | 4812.146 |  |
| 615.0 | 4704.155 | 4819.98 |  |
| 615.5 | 4711.627 | 4827.821 |  |
| 616.0 | 4719.103 | 4835.668 |  |
| 616.5 | 4726.586 | 4843.521 |  |
| 617.0 | 4734.073 | 4851.381 |  |
| 617.5 | 4741.567 | 4859.247 |  |
| 618.0 | 4749.065 | 4867.119 |  |
| 618.5 | 4756.57 | 4874.998 |  |
| 619.0 | 4764.079 | 4882.883 |  |
| 619.5 | 4771.595 | 4890.775 |  |
| 620.0 | 4779.115 | 4898.673 |  |
| 620.5 | 4786.642 | 4906.577 |  |
| 621.0 | 4794.173 | 4914.488 |  |
| 621.5 | 4801.711 | 4922.405 |  |
| 622.0 | 4809.253 | 4930.328 |  |
| 622.5 | 4816.802 | 4938.258 |  |
| 623.0 | 4824.355 | 4946.194 |  |
| 623.5 | 4831.914 | 4954.136 |  |
| 624.0 | 4839.479 | 4962.085 |  |
| 624.5 | 4847.049 | 4970.041 |  |
| 625.0 | 4854.625 | 4978.002 |  |
| 625.5 | 4862.206 | 4985.97 |  |
| 626.0 | 4869.793 | 4993.945 |  |
| 626.5 | 4877.385 | 5001.925 |  |
| 627.0 | 4884.982 | 5009.912 |  |
| 627.5 | 4892.585 | 5017.906 |  |
| 628.0 | 4900.194 | 5025.906 |  |
| 628.5 | 4907.808 | 5033.912 |  |
| 629.0 | 4915.427 | 5041.924 |  |
| 629.5 | 4923.052 | 5049.943 |  |
| 630.0 | 4930.683 | 5057.969 |  |
| 630.5 | 4938.319 | 5066.001 |  |
| 631.0 | 4945.96 | 5074.039 |  |
| 631.5 | 4953.607 | 5082.083 |  |
| 632.0 | 4961.259 | 5090.134 |  |
| 632.5 | 4968.917 | 5098.191 |  |
| 633.0 | 4976.58 | 5106.255 |  |
| 633.5 | 4984.249 | 5114.325 |  |
| 634.0 | 4991.923 | 5122.401 |  |
| 634.5 | 4999.603 | 5130.484 |  |
| 635.0 | 5007.288 | 5138.573 |  |
| 635.5 | 5014.978 | 5146.668 |  |
| 636.0 | 5022.674 | 5154.77 |  |
| 636.5 | 5030.376 | 5162.878 |  |
| 637.0 | 5038.083 | 5170.993 |  |
| 637.5 | 5045.795 | 5179.113 |  |
| 638.0 | 5053.513 | 5187.241 |  |
| 638.5 | 5061.236 | 5195.374 |  |
| 639.0 | 5068.965 | 5203.514 |  |
| 639.5 | 5076.699 | 5211.661 |  |
| 640.0 | 5084.439 | 5219.814 |  |
| 640.5 | 5092.184 | 5227.973 |  |
| 641.0 | 5099.934 | 5236.138 |  |
| 641.5 | 5107.69 | 5244.31 |  |
| 642.0 | 5115.451 | 5252.488 |  |
| 642.5 | 5123.218 | 5260.673 |  |
| 643.0 | 5130.99 | 5268.864 |  |
| 643.5 | 5138.768 | 5277.061 |  |
| 644.0 | 5146.551 | 5285.265 |  |
| 644.5 | 5154.34 | 5293.475 |  |
| 645.0 | 5162.134 | 5301.692 |  |
| 645.5 | 5169.933 | 5309.915 |  |
| 646.0 | 5177.738 | 5318.144 |  |
| 646.5 | 5185.548 | 5326.379 |  |
| 647.0 | 5193.364 | 5334.621 |  |
| 647.5 | 5201.185 | 5342.87 |  |
| 648.0 | 5209.012 | 5351.125 |  |
| 648.5 | 5216.844 | 5359.386 |  |
| 649.0 | 5224.681 | 5367.653 |  |
| 649.5 | 5232.524 | 5375.927 |  |
| 650.0 | 5240.372 | 5384.207 |  |
| 650.5 | 5248.226 | 5392.494 |  |
| 651.0 | 5256.085 | 5400.787 |  |
| 651.5 | 5263.95 | 5409.086 |  |
| 652.0 | 5271.819 | 5417.392 |  |
| 652.5 | 5279.695 | 5425.704 |  |
| 653.0 | 5287.576 | 5434.022 |  |
| 653.5 | 5295.462 | 5442.347 |  |
| 654.0 | 5303.353 | 5450.678 |  |
| 654.5 | 5311.25 | 5459.016 |  |
| 655.0 | 5319.153 | 5467.36 |  |
| 655.5 | 5327.06 | 5475.71 |  |
| 656.0 | 5334.974 | 5484.067 |  |
| 656.5 | 5342.892 | 5492.43 |  |
| 657.0 | 5350.816 | 5500.799 |  |
| 657.5 | 5358.746 | 5509.175 |  |
| 658.0 | 5366.68 | 5517.557 |  |
| 658.5 | 5374.621 | 5525.946 |  |
| 659.0 | 5382.566 | 5534.341 |  |
| 659.5 | 5390.517 | 5542.742 |  |
| 660.0 | 5398.473 | 5551.149 |  |
| 660.5 | 5406.435 | 5559.563 |  |
| 661.0 | 5414.402 | 5567.984 |  |
| 661.5 | 5422.375 | 5576.411 |  |
| 662.0 | 5430.353 | 5584.844 |  |
| 662.5 | 5438.336 | 5593.283 |  |
| 663.0 | 5446.325 | 5601.729 |  |
| 663.5 | 5454.319 | 5610.181 |  |
| 664.0 | 5462.319 | 5618.64 |  |
| 664.5 | 5470.323 | 5627.105 |  |
| 665.0 | 5478.334 | 5635.576 |  |
| 665.5 | 5486.349 | 5644.054 |  |
| 666.0 | 5494.37 | 5652.538 |  |
| 666.5 | 5502.397 | 5661.029 |  |
| 667.0 | 5510.428 | 5669.526 |  |
| 667.5 | 5518.466 | 5678.029 |  |
| 668.0 | 5526.508 | 5686.538 |  |
| 668.5 | 5534.556 | 5695.054 |  |
| 669.0 | 5542.609 | 5703.577 |  |
| 669.5 | 5550.668 | 5712.105 |  |
| 670.0 | 5558.732 | 5720.64 |  |
| 670.5 | 5566.801 | 5729.182 |  |
| 671.0 | 5574.876 | 5737.73 |  |
| 671.5 | 5582.956 | 5746.284 |  |
| 672.0 | 5591.041 | 5754.845 |  |
| 672.5 | 5599.132 | 5763.411 |  |
| 673.0 | 5607.228 | 5771.985 |  |
| 673.5 | 5615.33 | 5780.564 |  |
| 674.0 | 5623.437 | 5789.151 |  |
| 674.5 | 5631.549 | 5797.743 |  |
| 675.0 | 5639.667 | 5806.342 |  |
| 675.5 | 5647.79 | 5814.947 |  |
| 676.0 | 5655.918 | 5823.558 |  |
| 676.5 | 5664.051 | 5832.176 |  |
| 677.0 | 5672.19 | 5840.801 |  |
| 677.5 | 5680.335 | 5849.431 |  |
| 678.0 | 5688.485 | 5858.068 |  |
| 678.5 | 5696.64 | 5866.712 |  |
| 679.0 | 5704.8 | 5875.362 |  |
| 679.5 | 5712.966 | 5884.018 |  |
| 680.0 | 5721.137 | 5892.68 |  |
| 680.5 | 5729.313 | 5901.349 |  |
| 681.0 | 5737.495 | 5910.024 |  |
| 681.5 | 5745.682 | 5918.706 |  |
| 682.0 | 5753.874 | 5927.394 |  |
| 682.5 | 5762.072 | 5936.088 |  |
| 683.0 | 5770.275 | 5944.789 |  |
| 683.5 | 5778.484 | 5953.496 |  |
| 684.0 | 5786.697 | 5962.21 |  |
| 684.5 | 5794.916 | 5970.93 |  |
| 685.0 | 5803.141 | 5979.656 |  |
| 685.5 | 5811.371 | 5988.388 |  |
| 686.0 | 5819.606 | 5997.127 |  |
| 686.5 | 5827.846 | 6005.873 |  |
| 687.0 | 5836.092 | 6014.625 |  |
| 687.5 | 5844.343 | 6023.383 |  |
| 688.0 | 5852.599 | 6032.147 |  |
| 688.5 | 5860.861 | 6040.918 |  |
| 689.0 | 5869.128 | 6049.695 |  |
| 689.5 | 5877.4 | 6058.479 |  |
| 690.0 | 5885.678 | 6067.269 |  |
| 690.5 | 5893.96 | 6076.065 |  |
| 691.0 | 5902.249 | 6084.868 |  |
| 691.5 | 5910.542 | 6093.677 |  |
| 692.0 | 5918.841 | 6102.492 |  |
| 692.5 | 5927.145 | 6111.314 |  |
| 693.0 | 5935.455 | 6120.142 |  |
| 693.5 | 5943.769 | 6128.977 |  |
| 694.0 | 5952.089 | 6137.818 |  |
| 694.5 | 5960.415 | 6146.665 |  |
| 695.0 | 5968.746 | 6155.519 |  |
| 695.5 | 5977.081 | 6164.379 |  |
| 696.0 | 5985.423 | 6173.245 |  |
| 696.5 | 5993.769 | 6182.118 |  |
| 697.0 | 6002.121 | 6190.997 |  |
| 697.5 | 6010.478 | 6199.883 |  |
| 698.0 | 6018.841 | 6208.775 |  |
| 698.5 | 6027.209 | 6217.673 |  |
| 699.0 | 6035.582 | 6226.578 |  |
| 699.5 | 6043.96 | 6235.489 |  |
| 700.0 | 6052.344 | 6244.406 |  |
| 700.5 | 6060.732 | 6253.33 |  |
| 701.0 | 6069.127 | 6262.26 |  |
| 701.5 | 6077.526 | 6271.196 |  |
| 702.0 | 6085.931 | 6280.139 |  |
| 702.5 | 6094.341 | 6289.088 |  |
| 703.0 | 6102.756 | 6298.044 |  |
| 703.5 | 6111.177 | 6307.006 |  |
| 704.0 | 6119.603 | 6315.974 |  |
| 704.5 | 6128.034 | 6324.949 |  |
| 705.0 | 6136.47 | 6333.93 |  |
| 705.5 | 6144.912 | 6342.918 |  |
| 706.0 | 6153.359 | 6351.912 |  |
| 706.5 | 6161.811 | 6360.912 |  |
| 707.0 | 6170.268 | 6369.918 |  |
| 707.5 | 6178.731 | 6378.931 |  |
| 708.0 | 6187.199 | 6387.951 |  |
| 708.5 | 6195.672 | 6396.977 |  |
| 709.0 | 6204.151 | 6406.009 |  |
| 709.5 | 6212.635 | 6415.047 |  |
| 710.0 | 6221.124 | 6424.092 |  |
| 710.5 | 6229.618 | 6433.143 |  |
| 711.0 | 6238.118 | 6442.201 |  |
| 711.5 | 6246.623 | 6451.265 |  |
| 712.0 | 6255.133 | 6460.335 |  |
| 712.5 | 6263.648 | 6469.412 |  |
| 713.0 | 6272.169 | 6478.495 |  |
| 713.5 | 6280.695 | 6487.584 |  |
| 714.0 | 6289.226 | 6496.68 |  |
| 714.5 | 6297.762 | 6505.782 |  |
| 715.0 | 6306.304 | 6514.891 |  |
| 715.5 | 6314.85 | 6524.006 |  |
| 716.0 | 6323.403 | 6533.127 |  |
| 716.5 | 6331.96 | 6542.255 |  |
| 717.0 | 6340.522 | 6551.389 |  |
| 717.5 | 6349.09 | 6560.529 |  |
| 718.0 | 6357.663 | 6569.676 |  |
| 718.5 | 6366.242 | 6578.829 |  |
| 719.0 | 6374.825 | 6587.988 |  |
| 719.5 | 6383.414 | 6597.154 |  |
| 720.0 | 6392.008 | 6606.327 |  |
| 720.5 | 6400.607 | 6615.505 |  |
| 721.0 | 6409.212 | 6624.69 |  |
| 721.5 | 6417.821 | 6633.882 |  |
| 722.0 | 6426.436 | 6643.079 |  |
| 722.5 | 6435.056 | 6652.284 |  |
| 723.0 | 6443.682 | 6661.494 |  |
| 723.5 | 6452.312 | 6670.711 |  |
| 724.0 | 6460.948 | 6679.934 |  |
| 724.5 | 6469.589 | 6689.164 |  |
| 725.0 | 6478.235 | 6698.4 |  |
| 725.5 | 6486.887 | 6707.642 |  |
| 726.0 | 6495.543 | 6716.891 |  |
| 726.5 | 6504.205 | 6726.146 |  |
| 727.0 | 6512.872 | 6735.407 |  |
| 727.5 | 6521.545 | 6744.675 |  |
| 728.0 | 6530.222 | 6753.949 |  |
| 728.5 | 6538.905 | 6763.23 |  |
| 729.0 | 6547.593 | 6772.517 |  |
| 729.5 | 6556.286 | 6781.81 |  |
| 730.0 | 6564.984 | 6791.11 |  |
| 730.5 | 6573.688 | 6800.416 |  |
| 731.0 | 6582.397 | 6809.729 |  |
| 731.5 | 6591.111 | 6819.047 |  |
| 732.0 | 6599.83 | 6828.373 |  |
| 732.5 | 6608.554 | 6837.704 |  |
| 733.0 | 6617.284 | 6847.042 |  |
| 733.5 | 6626.018 | 6856.386 |  |
| 734.0 | 6634.758 | 6865.737 |  |
| 734.5 | 6643.504 | 6875.094 |  |
| 735.0 | 6652.254 | 6884.458 |  |
| 735.5 | 6661.009 | 6893.827 |  |
| 736.0 | 6669.77 | 6903.203 |  |
| 736.5 | 6678.536 | 6912.586 |  |
| 737.0 | 6687.307 | 6921.975 |  |
| 737.5 | 6696.083 | 6931.37 |  |
| 738.0 | 6704.865 | 6940.772 |  |
| 738.5 | 6713.652 | 6950.18 |  |
| 739.0 | 6722.443 | 6959.594 |  |
| 739.5 | 6731.24 | 6969.015 |  |
| 740.0 | 6740.042 | 6978.442 |  |
| 740.5 | 6748.85 | 6987.876 |  |
| 741.0 | 6757.662 | 6997.316 |  |
| 741.5 | 6766.48 | 7006.762 |  |
| 742.0 | 6775.303 | 7016.214 |  |
| 742.5 | 6784.131 | 7025.673 |  |
| 743.0 | 6792.964 | 7035.139 |  |
| 743.5 | 6801.803 | 7044.611 |  |
| 744.0 | 6810.646 | 7054.089 |  |
| 744.5 | 6819.495 | 7063.573 |  |
| 745.0 | 6828.349 | 7073.064 |  |
| 745.5 | 6837.208 | 7082.561 |  |
| 746.0 | 6846.072 | 7092.065 |  |
| 746.5 | 6854.941 | 7101.575 |  |
| 747.0 | 6863.816 | 7111.091 |  |
| 747.5 | 6872.695 | 7120.614 |  |
| 748.0 | 6881.58 | 7130.143 |  |
| 748.5 | 6890.47 | 7139.679 |  |
| 749.0 | 6899.365 | 7149.22 |  |
| 749.5 | 6908.266 | 7158.769 |  |
| 750.0 | 6917.171 | 7168.323 |  |
| 750.5 | 6926.082 | 7177.884 |  |
| 751.0 | 6934.997 | 7187.451 |  |
| 751.5 | 6943.918 | 7197.025 |  |
| 752.0 | 6952.844 | 7206.605 |  |
| 752.5 | 6961.775 | 7216.192 |  |
| 753.0 | 6970.712 | 7225.784 |  |
| 753.5 | 6979.653 | 7235.384 |  |
| 754.0 | 6988.6 | 7244.989 |  |
| 754.5 | 6997.552 | 7254.601 |  |
| 755.0 | 7006.508 | 7264.219 |  |
| 755.5 | 7015.47 | 7273.844 |  |
| 756.0 | 7024.437 | 7283.475 |  |
| 756.5 | 7033.41 | 7293.112 |  |
| 757.0 | 7042.387 | 7302.756 |  |
| 757.5 | 7051.37 | 7312.406 |  |
| 758.0 | 7060.357 | 7322.063 |  |
| 758.5 | 7069.35 | 7331.726 |  |
| 759.0 | 7078.348 | 7341.395 |  |
| 759.5 | 7087.351 | 7351.071 |  |
| 760.0 | 7096.359 | 7360.753 |  |
| 760.5 | 7105.372 | 7370.441 |  |
| 761.0 | 7114.391 | 7380.136 |  |
| 761.5 | 7123.414 | 7389.837 |  |
| 762.0 | 7132.443 | 7399.545 |  |
| 762.5 | 7141.477 | 7409.258 |  |
| 763.0 | 7150.515 | 7418.979 |  |
| 763.5 | 7159.559 | 7428.705 |  |
| 764.0 | 7168.608 | 7438.438 |  |
| 764.5 | 7177.663 | 7448.178 |  |
| 765.0 | 7186.722 | 7457.923 |  |
| 765.5 | 7195.786 | 7467.675 |  |
| 766.0 | 7204.856 | 7477.434 |  |
| 766.5 | 7213.93 | 7487.199 |  |
| 767.0 | 7223.01 | 7496.97 |  |
| 767.5 | 7232.095 | 7506.748 |  |
| 768.0 | 7241.185 | 7516.532 |  |
| 768.5 | 7250.28 | 7526.322 |  |
| 769.0 | 7259.38 | 7536.119 |  |
| 769.5 | 7268.485 | 7545.922 |  |
| 770.0 | 7277.595 | 7555.731 |  |
| 770.5 | 7286.711 | 7565.547 |  |
| 771.0 | 7295.831 | 7575.369 |  |
| 771.5 | 7304.957 | 7585.198 |  |
| 772.0 | 7314.087 | 7595.033 |  |
| 772.5 | 7323.223 | 7604.874 |  |
| 773.0 | 7332.364 | 7614.722 |  |
| 773.5 | 7341.51 | 7624.576 |  |
| 774.0 | 7350.661 | 7634.436 |  |
| 774.5 | 7359.817 | 7644.303 |  |
| 775.0 | 7368.978 | 7654.176 |  |
| 775.5 | 7378.144 | 7664.056 |  |
| 776.0 | 7387.315 | 7673.942 |  |
| 776.5 | 7396.492 | 7683.834 |  |
| 777.0 | 7405.673 | 7693.733 |  |
| 777.5 | 7414.86 | 7703.638 |  |
| 778.0 | 7424.051 | 7713.549 |  |
| 778.5 | 7433.248 | 7723.467 |  |
| 779.0 | 7442.45 | 7733.391 |  |
| 779.5 | 7451.656 | 7743.321 |  |
| 780.0 | 7460.868 | 7753.258 |  |
| 780.5 | 7470.085 | 7763.202 |  |
| 781.0 | 7479.307 | 7773.151 |  |
| 781.5 | 7488.534 | 7783.107 |  |
| 782.0 | 7497.766 | 7793.07 |  |
| 782.5 | 7507.003 | 7803.038 |  |
| 783.0 | 7516.246 | 7813.013 |  |
| 783.5 | 7525.493 | 7822.995 |  |
| 784.0 | 7534.745 | 7832.983 |  |
| 784.5 | 7544.003 | 7842.977 |  |
| 785.0 | 7553.265 | 7852.978 |  |
| 785.5 | 7562.532 | 7862.985 |  |
| 786.0 | 7571.805 | 7872.998 |  |
| 786.5 | 7581.083 | 7883.018 |  |
| 787.0 | 7590.365 | 7893.044 |  |
| 787.5 | 7599.653 | 7903.076 |  |
| 788.0 | 7608.946 | 7913.115 |  |
| 788.5 | 7618.243 | 7923.16 |  |
| 789.0 | 7627.546 | 7933.212 |  |
| 789.5 | 7636.854 | 7943.27 |  |
| 790.0 | 7646.167 | 7953.334 |  |
| 790.5 | 7655.485 | 7963.405 |  |
| 791.0 | 7664.808 | 7973.482 |  |
| 791.5 | 7674.136 | 7983.565 |  |
| 792.0 | 7683.469 | 7993.655 |  |
| 792.5 | 7692.807 | 8003.751 |  |
| 793.0 | 7702.15 | 8013.854 |  |
| 793.5 | 7711.498 | 8023.963 |  |
| 794.0 | 7720.851 | 8034.078 |  |
| 794.5 | 7730.209 | 8044.2 |  |
| 795.0 | 7739.572 | 8054.328 |  |
| 795.5 | 7748.94 | 8064.462 |  |
| 796.0 | 7758.313 | 8074.603 |  |
| 796.5 | 7767.692 | 8084.75 |  |
| 797.0 | 7777.075 | 8094.904 |  |
| 797.5 | 7786.463 | 8105.064 |  |
| 798.0 | 7795.856 | 8115.23 |  |
| 798.5 | 7805.255 | 8125.403 |  |
| 799.0 | 7814.658 | 8135.582 |  |
| 799.5 | 7824.066 | 8145.767 |  |
| 800.0 | 7833.48 | 8155.959 |  |
| 800.5 | 7842.898 | 8166.157 |  |
| 801.0 | 7852.321 | 8176.361 |  |
| 801.5 | 7861.749 | 8186.572 |  |
| 802.0 | 7871.183 | 8196.79 |  |
| 802.5 | 7880.621 | 8207.013 |  |
| 803.0 | 7890.064 | 8217.243 |  |
| 803.5 | 7899.513 | 8227.48 |  |
| 804.0 | 7908.966 | 8237.722 |  |
| 804.5 | 7918.424 | 8247.971 |  |
| 805.0 | 7927.888 | 8258.227 |  |
| 805.5 | 7937.356 | 8268.489 |  |
| 806.0 | 7946.829 | 8278.757 |  |
| 806.5 | 7956.308 | 8289.032 |  |
| 807.0 | 7965.791 | 8299.312 |  |
| 807.5 | 7975.279 | 8309.6 |  |
| 808.0 | 7984.772 | 8319.894 |  |
| 808.5 | 7994.271 | 8330.194 |  |
| 809.0 | 8003.774 | 8340.5 |  |
| 809.5 | 8013.282 | 8350.813 |  |
| 810.0 | 8022.795 | 8361.132 |  |
| 810.5 | 8032.313 | 8371.458 |  |
| 811.0 | 8041.836 | 8381.79 |  |
| 811.5 | 8051.364 | 8392.128 |  |
| 812.0 | 8060.897 | 8402.473 |  |
| 812.5 | 8070.436 | 8412.824 |  |
| 813.0 | 8079.979 | 8423.181 |  |
| 813.5 | 8089.527 | 8433.545 |  |
| 814.0 | 8099.079 | 8443.915 |  |
| 814.5 | 8108.637 | 8454.292 |  |
| 815.0 | 8118.2 | 8464.675 |  |
| 815.5 | 8127.768 | 8475.064 |  |
| 816.0 | 8137.341 | 8485.459 |  |
| 816.5 | 8146.919 | 8495.862 |  |
| 817.0 | 8156.501 | 8506.27 |  |
| 817.5 | 8166.089 | 8516.685 |  |
| 818.0 | 8175.682 | 8527.106 |  |
| 818.5 | 8185.279 | 8537.533 |  |
| 819.0 | 8194.882 | 8547.967 |  |
| 819.5 | 8204.489 | 8558.408 |  |
| 820.0 | 8214.102 | 8568.854 |  |
| 820.5 | 8223.719 | 8579.307 |  |
| 821.0 | 8233.342 | 8589.767 |  |
| 821.5 | 8242.969 | 8600.232 |  |
| 822.0 | 8252.601 | 8610.704 |  |
| 822.5 | 8262.238 | 8621.183 |  |
| 823.0 | 8271.88 | 8631.668 |  |
| 823.5 | 8281.528 | 8642.159 |  |
| 824.0 | 8291.18 | 8652.657 |  |
| 824.5 | 8300.837 | 8663.161 |  |
| 825.0 | 8310.498 | 8673.671 |  |
| 825.5 | 8320.165 | 8684.188 |  |
| 826.0 | 8329.837 | 8694.711 |  |
| 826.5 | 8339.514 | 8705.24 |  |
| 827.0 | 8349.195 | 8715.776 |  |
| 827.5 | 8358.882 | 8726.318 |  |
| 828.0 | 8368.573 | 8736.867 |  |
| 828.5 | 8378.27 | 8747.422 |  |
| 829.0 | 8387.971 | 8757.983 |  |
| 829.5 | 8397.677 | 8768.551 |  |
| 830.0 | 8407.388 | 8779.125 |  |
| 830.5 | 8417.105 | 8789.705 |  |
| 831.0 | 8426.826 | 8800.292 |  |
| 831.5 | 8436.551 | 8810.885 |  |
| 832.0 | 8446.282 | 8821.485 |  |
| 832.5 | 8456.018 | 8832.091 |  |
| 833.0 | 8465.759 | 8842.703 |  |
| 833.5 | 8475.504 | 8853.322 |  |
| 834.0 | 8485.255 | 8863.947 |  |
| 834.5 | 8495.01 | 8874.578 |  |
| 835.0 | 8504.77 | 8885.216 |  |
| 835.5 | 8514.536 | 8895.86 |  |
| 836.0 | 8524.306 | 8906.511 |  |
| 836.5 | 8534.081 | 8917.168 |  |
| 837.0 | 8543.861 | 8927.831 |  |
| 837.5 | 8553.646 | 8938.501 |  |
| 838.0 | 8563.435 | 8949.177 |  |
| 838.5 | 8573.23 | 8959.859 |  |
| 839.0 | 8583.029 | 8970.548 |  |
| 839.5 | 8592.834 | 8981.243 |  |
| 840.0 | 8602.643 | 8991.945 |  |
| 840.5 | 8612.457 | 9002.652 |  |
| 841.0 | 8622.276 | 9013.367 |  |
| 841.5 | 8632.1 | 9024.087 |  |
| 842.0 | 8641.929 | 9034.814 |  |
| 842.5 | 8651.763 | 9045.548 |  |
| 843.0 | 8661.602 | 9056.287 |  |
| 843.5 | 8671.445 | 9067.034 |  |
| 844.0 | 8681.294 | 9077.786 |  |
| 844.5 | 8691.147 | 9088.545 |  |
| 845.0 | 8701.005 | 9099.31 |  |
| 845.5 | 8710.868 | 9110.082 |  |
| 846.0 | 8720.736 | 9120.86 |  |
| 846.5 | 8730.609 | 9131.644 |  |
| 847.0 | 8740.486 | 9142.435 |  |
| 847.5 | 8750.369 | 9153.232 |  |
| 848.0 | 8760.256 | 9164.035 |  |
| 848.5 | 8770.148 | 9174.845 |  |
| 849.0 | 8780.046 | 9185.661 |  |
| 849.5 | 8789.948 | 9196.484 |  |
| 850.0 | 8799.854 | 9207.313 |  |
| 850.5 | 8809.766 | 9218.148 |  |
| 851.0 | 8819.683 | 9228.99 |  |
| 851.5 | 8829.604 | 9239.838 |  |
| 852.0 | 8839.53 | 9250.692 |  |
| 852.5 | 8849.462 | 9261.553 |  |
| 853.0 | 8859.398 | 9272.42 |  |
| 853.5 | 8869.338 | 9283.294 |  |
| 854.0 | 8879.284 | 9294.174 |  |
| 854.5 | 8889.235 | 9305.06 |  |
| 855.0 | 8899.19 | 9315.953 |  |
| 855.5 | 8909.15 | 9326.852 |  |
| 856.0 | 8919.116 | 9337.757 |  |
| 856.5 | 8929.085 | 9348.669 |  |
| 857.0 | 8939.06 | 9359.587 |  |
| 857.5 | 8949.04 | 9370.512 |  |
| 858.0 | 8959.024 | 9381.443 |  |
| 858.5 | 8969.014 | 9392.38 |  |
| 859.0 | 8979.008 | 9403.323 |  |
| 859.5 | 8989.007 | 9414.273 |  |
| 860.0 | 8999.011 | 9425.23 |  |
| 860.5 | 9009.019 | 9436.193 |  |
| 861.0 | 9019.033 | 9447.162 |  |
| 861.5 | 9029.051 | 9458.137 |  |
| 862.0 | 9039.074 | 9469.119 |  |
| 862.5 | 9049.102 | 9480.107 |  |
| 863.0 | 9059.135 | 9491.102 |  |
| 863.5 | 9069.173 | 9502.103 |  |
| 864.0 | 9079.215 | 9513.11 |  |
| 864.5 | 9089.262 | 9524.124 |  |
| 865.0 | 9099.314 | 9535.144 |  |
| 865.5 | 9109.371 | 9546.171 |  |
| 866.0 | 9119.433 | 9557.203 |  |
| 866.5 | 9129.5 | 9568.243 |  |
| 867.0 | 9139.571 | 9579.288 |  |
| 867.5 | 9149.647 | 9590.34 |  |
| 868.0 | 9159.728 | 9601.399 |  |
| 868.5 | 9169.814 | 9612.463 |  |
| 869.0 | 9179.904 | 9623.534 |  |
| 869.5 | 9190 | 9634.612 |  |
| 870.0 | 9200.1 | 9645.696 |  |
| 870.5 | 9210.205 | 9656.786 |  |
| 871.0 | 9220.315 | 9667.882 |  |
| 871.5 | 9230.429 | 9678.985 |  |
| 872.0 | 9240.549 | 9690.095 |  |
| 872.5 | 9250.673 | 9701.21 |  |
| 873.0 | 9260.802 | 9712.332 |  |
| 873.5 | 9270.936 | 9723.461 |  |
| 874.0 | 9281.075 | 9734.596 |  |
| 874.5 | 9291.218 | 9745.737 |  |
| 875.0 | 9301.366 | 9756.884 |  |
| 875.5 | 9311.519 | 9768.038 |  |
| 876.0 | 9321.677 | 9779.198 |  |
| 876.5 | 9331.839 | 9790.365 |  |
| 877.0 | 9342.007 | 9801.538 |  |
| 877.5 | 9352.179 | 9812.718 |  |
| 878.0 | 9362.356 | 9823.903 |  |
| 878.5 | 9372.537 | 9835.095 |  |
| 879.0 | 9382.724 | 9846.294 |  |
| 879.5 | 9392.915 | 9857.499 |  |
| 880.0 | 9403.111 | 9868.71 |  |
| 880.5 | 9413.312 | 9879.928 |  |
| 881.0 | 9423.517 | 9891.152 |  |
| 881.5 | 9433.728 | 9902.382 |  |
| 882.0 | 9443.943 | 9913.619 |  |
| 882.5 | 9454.163 | 9924.862 |  |
| 883.0 | 9464.387 | 9936.111 |  |
| 883.5 | 9474.617 | 9947.367 |  |
| 884.0 | 9484.851 | 9958.63 |  |
| 884.5 | 9495.09 | 9969.898 |  |
| 885.0 | 9505.333 | 9981.173 |  |
| 885.5 | 9515.582 | 9992.454 |  |
| 886.0 | 9525.835 | 10003.742 |  |
| 886.5 | 9536.093 | 10015.036 |  |
| 887.0 | 9546.356 | 10026.337 |  |
| 887.5 | 9556.623 | 10037.644 |  |
| 888.0 | 9566.895 | 10048.957 |  |
| 888.5 | 9577.172 | 10060.276 |  |
| 889.0 | 9587.454 | 10071.602 |  |
| 889.5 | 9597.74 | 10082.935 |  |
| 890.0 | 9608.032 | 10094.273 |  |
| 890.5 | 9618.328 | 10105.618 |  |
| 891.0 | 9628.628 | 10116.97 |  |
| 891.5 | 9638.934 | 10128.328 |  |
| 892.0 | 9649.244 | 10139.692 |  |
| 892.5 | 9659.559 | 10151.062 |  |
| 893.0 | 9669.878 | 10162.439 |  |
| 893.5 | 9680.203 | 10173.823 |  |
| 894.0 | 9690.532 | 10185.212 |  |
| 894.5 | 9700.866 | 10196.608 |  |
| 895.0 | 9711.204 | 10208.011 |  |
| 895.5 | 9721.548 | 10219.42 |  |
| 896.0 | 9731.896 | 10230.835 |  |
| 896.5 | 9742.249 | 10242.256 |  |
| 897.0 | 9752.606 | 10253.684 |  |
| 897.5 | 9762.968 | 10265.118 |  |
| 898.0 | 9773.335 | 10276.559 |  |
| 898.5 | 9783.707 | 10288.006 |  |
| 899.0 | 9794.083 | 10299.459 |  |
| 899.5 | 9804.464 | 10310.919 |  |
| 900.0 | 9814.85 | 10322.385 |  |
| 900.5 | 9825.241 | 10333.858 |  |
| 901.0 | 9835.636 | 10345.337 |  |
| 901.5 | 9846.036 | 10356.822 |  |
| 902.0 | 9856.441 | 10368.314 |  |
| 902.5 | 9866.85 | 10379.812 |  |
| 903.0 | 9877.264 | 10391.316 |  |
| 903.5 | 9887.683 | 10402.827 |  |
| 904.0 | 9898.106 | 10414.344 |  |
| 904.5 | 9908.535 | 10425.867 |  |
| 905.0 | 9918.968 | 10437.397 |  |
| 905.5 | 9929.405 | 10448.933 |  |
| 906.0 | 9939.847 | 10460.476 |  |
| 906.5 | 9950.294 | 10472.025 |  |
| 907.0 | 9960.746 | 10483.58 |  |
| 907.5 | 9971.203 | 10495.142 |  |
| 908.0 | 9981.664 | 10506.71 |  |
| 908.5 | 9992.129 | 10518.284 |  |
| 909.0 | 10002.6 | 10529.865 |  |
| 909.5 | 10013.075 | 10541.452 |  |
| 910.0 | 10023.555 | 10553.046 |  |
| 910.5 | 10034.039 | 10564.646 |  |
| 911.0 | 10044.529 | 10576.252 |  |
| 911.5 | 10055.023 | 10587.865 |  |
| 912.0 | 10065.521 | 10599.484 |  |
| 912.5 | 10076.024 | 10611.109 |  |
| 913.0 | 10086.532 | 10622.741 |  |
| 913.5 | 10097.045 | 10634.379 |  |
| 914.0 | 10107.562 | 10646.024 |  |
| 914.5 | 10118.084 | 10657.675 |  |
| 915.0 | 10128.611 | 10669.332 |  |
| 915.5 | 10139.142 | 10680.996 |  |
| 916.0 | 10149.678 | 10692.666 |  |
| 916.5 | 10160.219 | 10704.342 |  |
| 917.0 | 10170.764 | 10716.025 |  |
| 917.5 | 10181.314 | 10727.714 |  |
| 918.0 | 10191.869 | 10739.41 |  |
| 918.5 | 10202.428 | 10751.112 |  |
| 919.0 | 10212.992 | 10762.82 |  |
| 919.5 | 10223.561 | 10774.534 |  |
| 920.0 | 10234.134 | 10786.255 |  |
| 920.5 | 10244.712 | 10797.983 |  |
| 921.0 | 10255.294 | 10809.717 |  |
| 921.5 | 10265.882 | 10821.457 |  |
| 922.0 | 10276.474 | 10833.203 |  |
| 922.5 | 10287.07 | 10844.956 |  |
| 923.0 | 10297.671 | 10856.715 |  |
| 923.5 | 10308.277 | 10868.481 |  |
| 924.0 | 10318.888 | 10880.253 |  |
| 924.5 | 10329.503 | 10892.031 |  |
| 925.0 | 10340.123 | 10903.816 |  |
| 925.5 | 10350.747 | 10915.607 |  |
| 926.0 | 10361.376 | 10927.405 |  |
| 926.5 | 10372.01 | 10939.208 |  |
| 927.0 | 10382.648 | 10951.019 |  |
| 927.5 | 10393.291 | 10962.835 |  |
| 928.0 | 10403.939 | 10974.658 |  |
| 928.5 | 10414.591 | 10986.487 |  |
| 929.0 | 10425.248 | 10998.323 |  |
| 929.5 | 10435.909 | 11010.165 |  |
| 930.0 | 10446.575 | 11022.014 |  |
| 930.5 | 10457.246 | 11033.868 |  |
| 931.0 | 10467.921 | 11045.73 |  |
| 931.5 | 10478.601 | 11057.597 |  |
| 932.0 | 10489.286 | 11069.471 |  |
| 932.5 | 10499.975 | 11081.351 |  |
| 933.0 | 10510.669 | 11093.238 |  |
| 933.5 | 10521.368 | 11105.131 |  |
| 934.0 | 10532.071 | 11117.031 |  |
| 934.5 | 10542.778 | 11128.936 |  |
| 935.0 | 10553.491 | 11140.849 |  |
| 935.5 | 10564.208 | 11152.767 |  |
| 936.0 | 10574.929 | 11164.692 |  |
| 936.5 | 10585.655 | 11176.623 |  |
| 937.0 | 10596.386 | 11188.561 |  |
| 937.5 | 10607.121 | 11200.505 |  |
| 938.0 | 10617.861 | 11212.455 |  |
| 938.5 | 10628.606 | 11224.412 |  |
| 939.0 | 10639.355 | 11236.375 |  |
| 939.5 | 10650.109 | 11248.345 |  |
| 940.0 | 10660.867 | 11260.321 |  |
| 940.5 | 10671.63 | 11272.303 |  |
| 941.0 | 10682.398 | 11284.291 |  |
| 941.5 | 10693.17 | 11296.286 |  |
| 942.0 | 10703.947 | 11308.288 |  |
| 942.5 | 10714.728 | 11320.296 |  |
| 943.0 | 10725.514 | 11332.31 |  |
| 943.5 | 10736.304 | 11344.33 |  |
| 944.0 | 10747.099 | 11356.357 |  |
| 944.5 | 10757.899 | 11368.39 |  |
| 945.0 | 10768.703 | 11380.43 |  |
| 945.5 | 10779.512 | 11392.476 |  |
| 946.0 | 10790.326 | 11404.528 |  |
| 946.5 | 10801.144 | 11416.587 |  |
| 947.0 | 10811.966 | 11428.652 |  |
| 947.5 | 10822.793 | 11440.723 |  |
| 948.0 | 10833.625 | 11452.801 |  |
| 948.5 | 10844.461 | 11464.885 |  |
| 949.0 | 10855.302 | 11476.976 |  |
| 949.5 | 10866.148 | 11489.073 |  |
| 950.0 | 10876.998 | 11501.176 |  |
| 950.5 | 10887.852 | 11513.286 |  |
| 951.0 | 10898.711 | 11525.402 |  |
| 951.5 | 10909.575 | 11537.524 |  |
| 952.0 | 10920.443 | 11549.653 |  |
| 952.5 | 10931.316 | 11561.788 |  |
| 953.0 | 10942.194 | 11573.93 |  |
| 953.5 | 10953.076 | 11586.078 |  |
| 954.0 | 10963.962 | 11598.232 |  |
| 954.5 | 10974.853 | 11610.393 |  |
| 955.0 | 10985.749 | 11622.56 |  |
| 955.5 | 10996.649 | 11634.733 |  |
| 956.0 | 11007.554 | 11646.913 |  |
| 956.5 | 11018.463 | 11659.099 |  |
| 957.0 | 11029.377 | 11671.292 |  |
| 957.5 | 11040.295 | 11683.491 |  |
| 958.0 | 11051.218 | 11695.696 |  |
| 958.5 | 11062.145 | 11707.907 |  |
| 959.0 | 11073.077 | 11720.125 |  |
| 959.5 | 11084.014 | 11732.35 |  |
| 960.0 | 11094.955 | 11744.581 |  |
| 960.5 | 11105.901 | 11756.818 |  |
| 961.0 | 11116.851 | 11769.061 |  |
| 961.5 | 11127.805 | 11781.311 |  |
| 962.0 | 11138.765 | 11793.567 |  |
| 962.5 | 11149.728 | 11805.83 |  |
| 963.0 | 11160.697 | 11818.099 |  |
| 963.5 | 11171.669 | 11830.374 |  |
| 964.0 | 11182.647 | 11842.656 |  |
| 964.5 | 11193.628 | 11854.944 |  |
| 965.0 | 11204.615 | 11867.239 |  |
| 965.5 | 11215.606 | 11879.539 |  |
| 966.0 | 11226.601 | 11891.847 |  |
| 966.5 | 11237.601 | 11904.16 |  |
| 967.0 | 11248.606 | 11916.48 |  |
| 967.5 | 11259.614 | 11928.807 |  |
| 968.0 | 11270.628 | 11941.139 |  |
| 968.5 | 11281.646 | 11953.478 |  |
| 969.0 | 11292.668 | 11965.824 |  |
| 969.5 | 11303.695 | 11978.176 |  |
| 970.0 | 11314.727 | 11990.534 |  |
| 970.5 | 11325.763 | 12002.898 |  |
| 971.0 | 11336.803 | 12015.269 |  |
| 971.5 | 11347.849 | 12027.647 |  |
| 972.0 | 11358.898 | 12040.03 |  |
| 972.5 | 11369.952 | 12052.42 |  |
| 973.0 | 11381.011 | 12064.817 |  |
| 973.5 | 11392.074 | 12077.219 |  |
| 974.0 | 11403.141 | 12089.629 |  |
| 974.5 | 11414.213 | 12102.044 |  |
| 975.0 | 11425.29 | 12114.466 |  |
| 975.5 | 11436.371 | 12126.894 |  |
| 976.0 | 11447.456 | 12139.329 |  |
| 976.5 | 11458.546 | 12151.77 |  |
| 977.0 | 11469.641 | 12164.217 |  |
| 977.5 | 11480.74 | 12176.671 |  |
| 978.0 | 11491.843 | 12189.131 |  |
| 978.5 | 11502.951 | 12201.598 |  |
| 979.0 | 11514.063 | 12214.071 |  |
| 979.5 | 11525.18 | 12226.55 |  |
| 980.0 | 11536.302 | 12239.036 |  |
| 980.5 | 11547.428 | 12251.528 |  |
| 981.0 | 11558.558 | 12264.026 |  |
| 981.5 | 11569.693 | 12276.531 |  |
| 982.0 | 11580.832 | 12289.042 |  |
| 982.5 | 11591.976 | 12301.559 |  |
| 983.0 | 11603.124 | 12314.083 |  |
| 983.5 | 11614.277 | 12326.613 |  |
| 984.0 | 11625.434 | 12339.15 |  |
| 984.5 | 11636.595 | 12351.693 |  |
| 985.0 | 11647.761 | 12364.242 |  |
| 985.5 | 11658.932 | 12376.798 |  |
| 986.0 | 11670.107 | 12389.36 |  |
| 986.5 | 11681.286 | 12401.929 |  |
| 987.0 | 11692.47 | 12414.503 |  |
| 987.5 | 11703.659 | 12427.085 |  |
| 988.0 | 11714.851 | 12439.672 |  |
| 988.5 | 11726.049 | 12452.266 |  |
| 989.0 | 11737.25 | 12464.866 |  |
| 989.5 | 11748.457 | 12477.473 |  |
| 990.0 | 11759.667 | 12490.086 |  |
| 990.5 | 11770.882 | 12502.706 |  |
| 991.0 | 11782.102 | 12515.331 |  |
| 991.5 | 11793.326 | 12527.964 |  |
| 992.0 | 11804.554 | 12540.602 |  |
| 992.5 | 11815.787 | 12553.247 |  |
| 993.0 | 11827.024 | 12565.898 |  |
| 993.5 | 11838.266 | 12578.556 |  |
| 994.0 | 11849.512 | 12591.22 |  |
| 994.5 | 11860.763 | 12603.891 |  |
| 995.0 | 11872.018 | 12616.567 |  |
| 995.5 | 11883.277 | 12629.25 |  |
| 996.0 | 11894.541 | 12641.94 |  |
| 996.5 | 11905.809 | 12654.636 |  |
| 997.0 | 11917.082 | 12667.338 |  |
| 997.5 | 11928.359 | 12680.047 |  |
| 998.0 | 11939.641 | 12692.762 |  |
| 998.5 | 11950.927 | 12705.483 |  |
| 999.0 | 11962.217 | 12718.211 |  |
| 999.5 | 11973.512 | 12730.945 |  |
| 1000.0 | 11984.812 | 12743.686 |  |